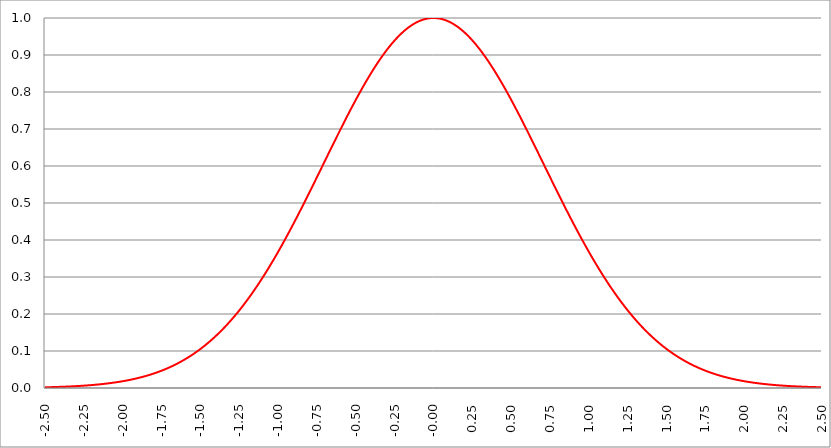
| Category | Series 1 | Series 0 | Series 2 |
|---|---|---|---|
| -2.5 | 0.002 |  |  |
| -2.4975 | 0.002 |  |  |
| -2.495 | 0.002 |  |  |
| -2.4925 | 0.002 |  |  |
| -2.49 | 0.002 |  |  |
| -2.4875 | 0.002 |  |  |
| -2.485 | 0.002 |  |  |
| -2.4825 | 0.002 |  |  |
| -2.48 | 0.002 |  |  |
| -2.4775 | 0.002 |  |  |
| -2.475000000000001 | 0.002 |  |  |
| -2.472500000000001 | 0.002 |  |  |
| -2.470000000000001 | 0.002 |  |  |
| -2.467500000000001 | 0.002 |  |  |
| -2.465000000000001 | 0.002 |  |  |
| -2.462500000000001 | 0.002 |  |  |
| -2.460000000000001 | 0.002 |  |  |
| -2.457500000000001 | 0.002 |  |  |
| -2.455000000000001 | 0.002 |  |  |
| -2.452500000000001 | 0.002 |  |  |
| -2.450000000000001 | 0.002 |  |  |
| -2.447500000000001 | 0.003 |  |  |
| -2.445000000000001 | 0.003 |  |  |
| -2.442500000000001 | 0.003 |  |  |
| -2.440000000000001 | 0.003 |  |  |
| -2.437500000000001 | 0.003 |  |  |
| -2.435000000000001 | 0.003 |  |  |
| -2.432500000000001 | 0.003 |  |  |
| -2.430000000000001 | 0.003 |  |  |
| -2.427500000000002 | 0.003 |  |  |
| -2.425000000000002 | 0.003 |  |  |
| -2.422500000000002 | 0.003 |  |  |
| -2.420000000000002 | 0.003 |  |  |
| -2.417500000000002 | 0.003 |  |  |
| -2.415000000000002 | 0.003 |  |  |
| -2.412500000000002 | 0.003 |  |  |
| -2.410000000000002 | 0.003 |  |  |
| -2.407500000000002 | 0.003 |  |  |
| -2.405000000000002 | 0.003 |  |  |
| -2.402500000000002 | 0.003 |  |  |
| -2.400000000000002 | 0.003 |  |  |
| -2.397500000000002 | 0.003 |  |  |
| -2.395000000000002 | 0.003 |  |  |
| -2.392500000000002 | 0.003 |  |  |
| -2.390000000000002 | 0.003 |  |  |
| -2.387500000000002 | 0.003 |  |  |
| -2.385000000000002 | 0.003 |  |  |
| -2.382500000000002 | 0.003 |  |  |
| -2.380000000000002 | 0.003 |  |  |
| -2.377500000000003 | 0.004 |  |  |
| -2.375000000000003 | 0.004 |  |  |
| -2.372500000000003 | 0.004 |  |  |
| -2.370000000000003 | 0.004 |  |  |
| -2.367500000000003 | 0.004 |  |  |
| -2.365000000000003 | 0.004 |  |  |
| -2.362500000000003 | 0.004 |  |  |
| -2.360000000000003 | 0.004 |  |  |
| -2.357500000000003 | 0.004 |  |  |
| -2.355000000000003 | 0.004 |  |  |
| -2.352500000000003 | 0.004 |  |  |
| -2.350000000000003 | 0.004 |  |  |
| -2.347500000000003 | 0.004 |  |  |
| -2.345000000000003 | 0.004 |  |  |
| -2.342500000000003 | 0.004 |  |  |
| -2.340000000000003 | 0.004 |  |  |
| -2.337500000000003 | 0.004 |  |  |
| -2.335000000000003 | 0.004 |  |  |
| -2.332500000000004 | 0.004 |  |  |
| -2.330000000000004 | 0.004 |  |  |
| -2.327500000000004 | 0.004 |  |  |
| -2.325000000000004 | 0.004 |  |  |
| -2.322500000000004 | 0.005 |  |  |
| -2.320000000000004 | 0.005 |  |  |
| -2.317500000000004 | 0.005 |  |  |
| -2.315000000000004 | 0.005 |  |  |
| -2.312500000000004 | 0.005 |  |  |
| -2.310000000000004 | 0.005 |  |  |
| -2.307500000000004 | 0.005 |  |  |
| -2.305000000000004 | 0.005 |  |  |
| -2.302500000000004 | 0.005 |  |  |
| -2.300000000000004 | 0.005 |  |  |
| -2.297500000000004 | 0.005 |  |  |
| -2.295000000000004 | 0.005 |  |  |
| -2.292500000000004 | 0.005 |  |  |
| -2.290000000000004 | 0.005 |  |  |
| -2.287500000000004 | 0.005 |  |  |
| -2.285000000000005 | 0.005 |  |  |
| -2.282500000000005 | 0.005 |  |  |
| -2.280000000000005 | 0.006 |  |  |
| -2.277500000000005 | 0.006 |  |  |
| -2.275000000000005 | 0.006 |  |  |
| -2.272500000000005 | 0.006 |  |  |
| -2.270000000000005 | 0.006 |  |  |
| -2.267500000000005 | 0.006 |  |  |
| -2.265000000000005 | 0.006 |  |  |
| -2.262500000000005 | 0.006 |  |  |
| -2.260000000000005 | 0.006 |  |  |
| -2.257500000000005 | 0.006 |  |  |
| -2.255000000000005 | 0.006 |  |  |
| -2.252500000000005 | 0.006 |  |  |
| -2.250000000000005 | 0.006 |  |  |
| -2.247500000000005 | 0.006 |  |  |
| -2.245000000000005 | 0.006 |  |  |
| -2.242500000000005 | 0.007 |  |  |
| -2.240000000000006 | 0.007 |  |  |
| -2.237500000000006 | 0.007 |  |  |
| -2.235000000000006 | 0.007 |  |  |
| -2.232500000000006 | 0.007 |  |  |
| -2.230000000000006 | 0.007 |  |  |
| -2.227500000000006 | 0.007 |  |  |
| -2.225000000000006 | 0.007 |  |  |
| -2.222500000000006 | 0.007 |  |  |
| -2.220000000000006 | 0.007 |  |  |
| -2.217500000000006 | 0.007 |  |  |
| -2.215000000000006 | 0.007 |  |  |
| -2.212500000000006 | 0.007 |  |  |
| -2.210000000000006 | 0.008 |  |  |
| -2.207500000000006 | 0.008 |  |  |
| -2.205000000000006 | 0.008 |  |  |
| -2.202500000000006 | 0.008 |  |  |
| -2.200000000000006 | 0.008 |  |  |
| -2.197500000000006 | 0.008 |  |  |
| -2.195000000000006 | 0.008 |  |  |
| -2.192500000000007 | 0.008 |  |  |
| -2.190000000000007 | 0.008 |  |  |
| -2.187500000000006 | 0.008 |  |  |
| -2.185000000000007 | 0.008 |  |  |
| -2.182500000000007 | 0.009 |  |  |
| -2.180000000000007 | 0.009 |  |  |
| -2.177500000000007 | 0.009 |  |  |
| -2.175000000000007 | 0.009 |  |  |
| -2.172500000000007 | 0.009 |  |  |
| -2.170000000000007 | 0.009 |  |  |
| -2.167500000000007 | 0.009 |  |  |
| -2.165000000000007 | 0.009 |  |  |
| -2.162500000000007 | 0.009 |  |  |
| -2.160000000000007 | 0.009 |  |  |
| -2.157500000000007 | 0.01 |  |  |
| -2.155000000000007 | 0.01 |  |  |
| -2.152500000000007 | 0.01 |  |  |
| -2.150000000000007 | 0.01 |  |  |
| -2.147500000000007 | 0.01 |  |  |
| -2.145000000000008 | 0.01 |  |  |
| -2.142500000000008 | 0.01 |  |  |
| -2.140000000000008 | 0.01 |  |  |
| -2.137500000000008 | 0.01 |  |  |
| -2.135000000000008 | 0.01 |  |  |
| -2.132500000000008 | 0.011 |  |  |
| -2.130000000000008 | 0.011 |  |  |
| -2.127500000000008 | 0.011 |  |  |
| -2.125000000000008 | 0.011 |  |  |
| -2.122500000000008 | 0.011 |  |  |
| -2.120000000000008 | 0.011 |  |  |
| -2.117500000000008 | 0.011 |  |  |
| -2.115000000000008 | 0.011 |  |  |
| -2.112500000000008 | 0.012 |  |  |
| -2.110000000000008 | 0.012 |  |  |
| -2.107500000000008 | 0.012 |  |  |
| -2.105000000000008 | 0.012 |  |  |
| -2.102500000000008 | 0.012 |  |  |
| -2.100000000000009 | 0.012 |  |  |
| -2.097500000000009 | 0.012 |  |  |
| -2.095000000000009 | 0.012 |  |  |
| -2.092500000000009 | 0.013 |  |  |
| -2.090000000000009 | 0.013 |  |  |
| -2.087500000000009 | 0.013 |  |  |
| -2.085000000000009 | 0.013 |  |  |
| -2.082500000000009 | 0.013 |  |  |
| -2.080000000000009 | 0.013 |  |  |
| -2.077500000000009 | 0.013 |  |  |
| -2.075000000000009 | 0.013 |  |  |
| -2.072500000000009 | 0.014 |  |  |
| -2.070000000000009 | 0.014 |  |  |
| -2.06750000000001 | 0.014 |  |  |
| -2.065000000000009 | 0.014 |  |  |
| -2.062500000000009 | 0.014 |  |  |
| -2.060000000000009 | 0.014 |  |  |
| -2.057500000000009 | 0.015 |  |  |
| -2.055000000000009 | 0.015 |  |  |
| -2.05250000000001 | 0.015 |  |  |
| -2.05000000000001 | 0.015 |  |  |
| -2.04750000000001 | 0.015 |  |  |
| -2.04500000000001 | 0.015 |  |  |
| -2.04250000000001 | 0.015 |  |  |
| -2.04000000000001 | 0.016 |  |  |
| -2.03750000000001 | 0.016 |  |  |
| -2.03500000000001 | 0.016 |  |  |
| -2.03250000000001 | 0.016 |  |  |
| -2.03000000000001 | 0.016 |  |  |
| -2.02750000000001 | 0.016 |  |  |
| -2.02500000000001 | 0.017 |  |  |
| -2.02250000000001 | 0.017 |  |  |
| -2.02000000000001 | 0.017 |  |  |
| -2.01750000000001 | 0.017 |  |  |
| -2.01500000000001 | 0.017 |  |  |
| -2.01250000000001 | 0.017 |  |  |
| -2.01000000000001 | 0.018 |  |  |
| -2.00750000000001 | 0.018 |  |  |
| -2.005000000000011 | 0.018 |  |  |
| -2.002500000000011 | 0.018 |  |  |
| -2.000000000000011 | 0.018 |  |  |
| -1.997500000000011 | 0.018 |  |  |
| -1.995000000000011 | 0.019 |  |  |
| -1.992500000000011 | 0.019 |  |  |
| -1.990000000000011 | 0.019 |  |  |
| -1.987500000000011 | 0.019 |  |  |
| -1.985000000000011 | 0.019 |  |  |
| -1.982500000000011 | 0.02 |  |  |
| -1.980000000000011 | 0.02 |  |  |
| -1.977500000000011 | 0.02 |  |  |
| -1.975000000000011 | 0.02 |  |  |
| -1.972500000000011 | 0.02 |  |  |
| -1.970000000000011 | 0.021 |  |  |
| -1.967500000000011 | 0.021 |  |  |
| -1.965000000000011 | 0.021 |  |  |
| -1.962500000000011 | 0.021 |  |  |
| -1.960000000000011 | 0.021 |  |  |
| -1.957500000000012 | 0.022 |  |  |
| -1.955000000000012 | 0.022 |  |  |
| -1.952500000000012 | 0.022 |  |  |
| -1.950000000000012 | 0.022 |  |  |
| -1.947500000000012 | 0.023 |  |  |
| -1.945000000000012 | 0.023 |  |  |
| -1.942500000000012 | 0.023 |  |  |
| -1.940000000000012 | 0.023 |  |  |
| -1.937500000000012 | 0.023 |  |  |
| -1.935000000000012 | 0.024 |  |  |
| -1.932500000000012 | 0.024 |  |  |
| -1.930000000000012 | 0.024 |  |  |
| -1.927500000000012 | 0.024 |  |  |
| -1.925000000000012 | 0.025 |  |  |
| -1.922500000000012 | 0.025 |  |  |
| -1.920000000000012 | 0.025 |  |  |
| -1.917500000000012 | 0.025 |  |  |
| -1.915000000000012 | 0.026 |  |  |
| -1.912500000000012 | 0.026 |  |  |
| -1.910000000000013 | 0.026 |  |  |
| -1.907500000000013 | 0.026 |  |  |
| -1.905000000000013 | 0.027 |  |  |
| -1.902500000000013 | 0.027 |  |  |
| -1.900000000000013 | 0.027 |  |  |
| -1.897500000000013 | 0.027 |  |  |
| -1.895000000000013 | 0.028 |  |  |
| -1.892500000000013 | 0.028 |  |  |
| -1.890000000000013 | 0.028 |  |  |
| -1.887500000000013 | 0.028 |  |  |
| -1.885000000000013 | 0.029 |  |  |
| -1.882500000000013 | 0.029 |  |  |
| -1.880000000000013 | 0.029 |  |  |
| -1.877500000000013 | 0.029 |  |  |
| -1.875000000000013 | 0.03 |  |  |
| -1.872500000000013 | 0.03 |  |  |
| -1.870000000000013 | 0.03 |  |  |
| -1.867500000000013 | 0.031 |  |  |
| -1.865000000000013 | 0.031 |  |  |
| -1.862500000000014 | 0.031 |  |  |
| -1.860000000000014 | 0.031 |  |  |
| -1.857500000000014 | 0.032 |  |  |
| -1.855000000000014 | 0.032 |  |  |
| -1.852500000000014 | 0.032 |  |  |
| -1.850000000000014 | 0.033 |  |  |
| -1.847500000000014 | 0.033 |  |  |
| -1.845000000000014 | 0.033 |  |  |
| -1.842500000000014 | 0.034 |  |  |
| -1.840000000000014 | 0.034 |  |  |
| -1.837500000000014 | 0.034 |  |  |
| -1.835000000000014 | 0.034 |  |  |
| -1.832500000000014 | 0.035 |  |  |
| -1.830000000000014 | 0.035 |  |  |
| -1.827500000000014 | 0.035 |  |  |
| -1.825000000000014 | 0.036 |  |  |
| -1.822500000000014 | 0.036 |  |  |
| -1.820000000000014 | 0.036 |  |  |
| -1.817500000000015 | 0.037 |  |  |
| -1.815000000000015 | 0.037 |  |  |
| -1.812500000000015 | 0.037 |  |  |
| -1.810000000000015 | 0.038 |  |  |
| -1.807500000000015 | 0.038 |  |  |
| -1.805000000000015 | 0.038 |  |  |
| -1.802500000000015 | 0.039 |  |  |
| -1.800000000000015 | 0.039 |  |  |
| -1.797500000000015 | 0.04 |  |  |
| -1.795000000000015 | 0.04 |  |  |
| -1.792500000000015 | 0.04 |  |  |
| -1.790000000000015 | 0.041 |  |  |
| -1.787500000000015 | 0.041 |  |  |
| -1.785000000000015 | 0.041 |  |  |
| -1.782500000000015 | 0.042 |  |  |
| -1.780000000000015 | 0.042 |  |  |
| -1.777500000000015 | 0.042 |  |  |
| -1.775000000000015 | 0.043 |  |  |
| -1.772500000000015 | 0.043 |  |  |
| -1.770000000000015 | 0.044 |  |  |
| -1.767500000000016 | 0.044 |  |  |
| -1.765000000000016 | 0.044 |  |  |
| -1.762500000000016 | 0.045 |  |  |
| -1.760000000000016 | 0.045 |  |  |
| -1.757500000000016 | 0.046 |  |  |
| -1.755000000000016 | 0.046 |  |  |
| -1.752500000000016 | 0.046 |  |  |
| -1.750000000000016 | 0.047 |  |  |
| -1.747500000000016 | 0.047 |  |  |
| -1.745000000000016 | 0.048 |  |  |
| -1.742500000000016 | 0.048 |  |  |
| -1.740000000000016 | 0.048 |  |  |
| -1.737500000000016 | 0.049 |  |  |
| -1.735000000000016 | 0.049 |  |  |
| -1.732500000000016 | 0.05 |  |  |
| -1.730000000000016 | 0.05 |  |  |
| -1.727500000000016 | 0.051 |  |  |
| -1.725000000000016 | 0.051 |  |  |
| -1.722500000000017 | 0.051 |  |  |
| -1.720000000000017 | 0.052 |  |  |
| -1.717500000000017 | 0.052 |  |  |
| -1.715000000000017 | 0.053 |  |  |
| -1.712500000000017 | 0.053 |  |  |
| -1.710000000000017 | 0.054 |  |  |
| -1.707500000000017 | 0.054 |  |  |
| -1.705000000000017 | 0.055 |  |  |
| -1.702500000000017 | 0.055 |  |  |
| -1.700000000000017 | 0.056 |  |  |
| -1.697500000000017 | 0.056 |  |  |
| -1.695000000000017 | 0.057 |  |  |
| -1.692500000000017 | 0.057 |  |  |
| -1.690000000000017 | 0.057 |  |  |
| -1.687500000000017 | 0.058 |  |  |
| -1.685000000000017 | 0.058 |  |  |
| -1.682500000000017 | 0.059 |  |  |
| -1.680000000000017 | 0.059 |  |  |
| -1.677500000000017 | 0.06 |  |  |
| -1.675000000000017 | 0.06 |  |  |
| -1.672500000000018 | 0.061 |  |  |
| -1.670000000000018 | 0.061 |  |  |
| -1.667500000000018 | 0.062 |  |  |
| -1.665000000000018 | 0.063 |  |  |
| -1.662500000000018 | 0.063 |  |  |
| -1.660000000000018 | 0.064 |  |  |
| -1.657500000000018 | 0.064 |  |  |
| -1.655000000000018 | 0.065 |  |  |
| -1.652500000000018 | 0.065 |  |  |
| -1.650000000000018 | 0.066 |  |  |
| -1.647500000000018 | 0.066 |  |  |
| -1.645000000000018 | 0.067 |  |  |
| -1.642500000000018 | 0.067 |  |  |
| -1.640000000000018 | 0.068 |  |  |
| -1.637500000000018 | 0.068 |  |  |
| -1.635000000000018 | 0.069 |  |  |
| -1.632500000000018 | 0.07 |  |  |
| -1.630000000000018 | 0.07 |  |  |
| -1.627500000000019 | 0.071 |  |  |
| -1.625000000000019 | 0.071 |  |  |
| -1.622500000000019 | 0.072 |  |  |
| -1.620000000000019 | 0.072 |  |  |
| -1.617500000000019 | 0.073 |  |  |
| -1.615000000000019 | 0.074 |  |  |
| -1.612500000000019 | 0.074 |  |  |
| -1.610000000000019 | 0.075 |  |  |
| -1.607500000000019 | 0.075 |  |  |
| -1.605000000000019 | 0.076 |  |  |
| -1.60250000000002 | 0.077 |  |  |
| -1.60000000000002 | 0.077 |  |  |
| -1.597500000000019 | 0.078 |  |  |
| -1.595000000000019 | 0.079 |  |  |
| -1.592500000000019 | 0.079 |  |  |
| -1.590000000000019 | 0.08 |  |  |
| -1.587500000000019 | 0.08 |  |  |
| -1.585000000000019 | 0.081 |  |  |
| -1.58250000000002 | 0.082 |  |  |
| -1.58000000000002 | 0.082 |  |  |
| -1.57750000000002 | 0.083 |  |  |
| -1.57500000000002 | 0.084 |  |  |
| -1.57250000000002 | 0.084 |  |  |
| -1.57000000000002 | 0.085 |  |  |
| -1.56750000000002 | 0.086 |  |  |
| -1.56500000000002 | 0.086 |  |  |
| -1.56250000000002 | 0.087 |  |  |
| -1.56000000000002 | 0.088 |  |  |
| -1.55750000000002 | 0.088 |  |  |
| -1.55500000000002 | 0.089 |  |  |
| -1.55250000000002 | 0.09 |  |  |
| -1.55000000000002 | 0.09 |  |  |
| -1.54750000000002 | 0.091 |  |  |
| -1.54500000000002 | 0.092 |  |  |
| -1.54250000000002 | 0.093 |  |  |
| -1.54000000000002 | 0.093 |  |  |
| -1.537500000000021 | 0.094 |  |  |
| -1.535000000000021 | 0.095 |  |  |
| -1.532500000000021 | 0.096 |  |  |
| -1.530000000000021 | 0.096 |  |  |
| -1.527500000000021 | 0.097 |  |  |
| -1.525000000000021 | 0.098 |  |  |
| -1.522500000000021 | 0.098 |  |  |
| -1.520000000000021 | 0.099 |  |  |
| -1.517500000000021 | 0.1 |  |  |
| -1.515000000000021 | 0.101 |  |  |
| -1.512500000000021 | 0.102 |  |  |
| -1.510000000000021 | 0.102 |  |  |
| -1.507500000000021 | 0.103 |  |  |
| -1.505000000000021 | 0.104 |  |  |
| -1.502500000000021 | 0.105 |  |  |
| -1.500000000000021 | 0.105 |  |  |
| -1.497500000000021 | 0.106 |  |  |
| -1.495000000000021 | 0.107 |  |  |
| -1.492500000000021 | 0.108 |  |  |
| -1.490000000000021 | 0.109 |  |  |
| -1.487500000000022 | 0.109 |  |  |
| -1.485000000000022 | 0.11 |  |  |
| -1.482500000000022 | 0.111 |  |  |
| -1.480000000000022 | 0.112 |  |  |
| -1.477500000000022 | 0.113 |  |  |
| -1.475000000000022 | 0.114 |  |  |
| -1.472500000000022 | 0.114 |  |  |
| -1.470000000000022 | 0.115 |  |  |
| -1.467500000000022 | 0.116 |  |  |
| -1.465000000000022 | 0.117 |  |  |
| -1.462500000000022 | 0.118 |  |  |
| -1.460000000000022 | 0.119 |  |  |
| -1.457500000000022 | 0.12 |  |  |
| -1.455000000000022 | 0.12 |  |  |
| -1.452500000000022 | 0.121 |  |  |
| -1.450000000000022 | 0.122 |  |  |
| -1.447500000000022 | 0.123 |  |  |
| -1.445000000000022 | 0.124 |  |  |
| -1.442500000000023 | 0.125 |  |  |
| -1.440000000000023 | 0.126 |  |  |
| -1.437500000000023 | 0.127 |  |  |
| -1.435000000000023 | 0.128 |  |  |
| -1.432500000000023 | 0.128 |  |  |
| -1.430000000000023 | 0.129 |  |  |
| -1.427500000000023 | 0.13 |  |  |
| -1.425000000000023 | 0.131 |  |  |
| -1.422500000000023 | 0.132 |  |  |
| -1.420000000000023 | 0.133 |  |  |
| -1.417500000000023 | 0.134 |  |  |
| -1.415000000000023 | 0.135 |  |  |
| -1.412500000000023 | 0.136 |  |  |
| -1.410000000000023 | 0.137 |  |  |
| -1.407500000000023 | 0.138 |  |  |
| -1.405000000000023 | 0.139 |  |  |
| -1.402500000000023 | 0.14 |  |  |
| -1.400000000000023 | 0.141 |  |  |
| -1.397500000000023 | 0.142 |  |  |
| -1.395000000000023 | 0.143 |  |  |
| -1.392500000000024 | 0.144 |  |  |
| -1.390000000000024 | 0.145 |  |  |
| -1.387500000000024 | 0.146 |  |  |
| -1.385000000000024 | 0.147 |  |  |
| -1.382500000000024 | 0.148 |  |  |
| -1.380000000000024 | 0.149 |  |  |
| -1.377500000000024 | 0.15 |  |  |
| -1.375000000000024 | 0.151 |  |  |
| -1.372500000000024 | 0.152 |  |  |
| -1.370000000000024 | 0.153 |  |  |
| -1.367500000000024 | 0.154 |  |  |
| -1.365000000000024 | 0.155 |  |  |
| -1.362500000000024 | 0.156 |  |  |
| -1.360000000000024 | 0.157 |  |  |
| -1.357500000000024 | 0.158 |  |  |
| -1.355000000000024 | 0.159 |  |  |
| -1.352500000000024 | 0.161 |  |  |
| -1.350000000000024 | 0.162 |  |  |
| -1.347500000000025 | 0.163 |  |  |
| -1.345000000000025 | 0.164 |  |  |
| -1.342500000000025 | 0.165 |  |  |
| -1.340000000000025 | 0.166 |  |  |
| -1.337500000000025 | 0.167 |  |  |
| -1.335000000000025 | 0.168 |  |  |
| -1.332500000000025 | 0.169 |  |  |
| -1.330000000000025 | 0.171 |  |  |
| -1.327500000000025 | 0.172 |  |  |
| -1.325000000000025 | 0.173 |  |  |
| -1.322500000000025 | 0.174 |  |  |
| -1.320000000000025 | 0.175 |  |  |
| -1.317500000000025 | 0.176 |  |  |
| -1.315000000000025 | 0.177 |  |  |
| -1.312500000000025 | 0.179 |  |  |
| -1.310000000000025 | 0.18 |  |  |
| -1.307500000000025 | 0.181 |  |  |
| -1.305000000000025 | 0.182 |  |  |
| -1.302500000000025 | 0.183 |  |  |
| -1.300000000000026 | 0.185 |  |  |
| -1.297500000000026 | 0.186 |  |  |
| -1.295000000000026 | 0.187 |  |  |
| -1.292500000000026 | 0.188 |  |  |
| -1.290000000000026 | 0.189 |  |  |
| -1.287500000000026 | 0.191 |  |  |
| -1.285000000000026 | 0.192 |  |  |
| -1.282500000000026 | 0.193 |  |  |
| -1.280000000000026 | 0.194 |  |  |
| -1.277500000000026 | 0.196 |  |  |
| -1.275000000000026 | 0.197 |  |  |
| -1.272500000000026 | 0.198 |  |  |
| -1.270000000000026 | 0.199 |  |  |
| -1.267500000000026 | 0.201 |  |  |
| -1.265000000000026 | 0.202 |  |  |
| -1.262500000000026 | 0.203 |  |  |
| -1.260000000000026 | 0.204 |  |  |
| -1.257500000000026 | 0.206 |  |  |
| -1.255000000000027 | 0.207 |  |  |
| -1.252500000000027 | 0.208 |  |  |
| -1.250000000000027 | 0.21 |  |  |
| -1.247500000000027 | 0.211 |  |  |
| -1.245000000000027 | 0.212 |  |  |
| -1.242500000000027 | 0.214 |  |  |
| -1.240000000000027 | 0.215 |  |  |
| -1.237500000000027 | 0.216 |  |  |
| -1.235000000000027 | 0.218 |  |  |
| -1.232500000000027 | 0.219 |  |  |
| -1.230000000000027 | 0.22 |  |  |
| -1.227500000000027 | 0.222 |  |  |
| -1.225000000000027 | 0.223 |  |  |
| -1.222500000000027 | 0.224 |  |  |
| -1.220000000000027 | 0.226 |  |  |
| -1.217500000000027 | 0.227 |  |  |
| -1.215000000000027 | 0.228 |  |  |
| -1.212500000000027 | 0.23 |  |  |
| -1.210000000000027 | 0.231 |  |  |
| -1.207500000000028 | 0.233 |  |  |
| -1.205000000000028 | 0.234 |  |  |
| -1.202500000000028 | 0.236 |  |  |
| -1.200000000000028 | 0.237 |  |  |
| -1.197500000000028 | 0.238 |  |  |
| -1.195000000000028 | 0.24 |  |  |
| -1.192500000000028 | 0.241 |  |  |
| -1.190000000000028 | 0.243 |  |  |
| -1.187500000000028 | 0.244 |  |  |
| -1.185000000000028 | 0.246 |  |  |
| -1.182500000000028 | 0.247 |  |  |
| -1.180000000000028 | 0.248 |  |  |
| -1.177500000000028 | 0.25 |  |  |
| -1.175000000000028 | 0.251 |  |  |
| -1.172500000000028 | 0.253 |  |  |
| -1.170000000000028 | 0.254 |  |  |
| -1.167500000000028 | 0.256 |  |  |
| -1.165000000000028 | 0.257 |  |  |
| -1.162500000000028 | 0.259 |  |  |
| -1.160000000000029 | 0.26 |  |  |
| -1.157500000000029 | 0.262 |  |  |
| -1.155000000000029 | 0.263 |  |  |
| -1.152500000000029 | 0.265 |  |  |
| -1.150000000000029 | 0.266 |  |  |
| -1.147500000000029 | 0.268 |  |  |
| -1.145000000000029 | 0.27 |  |  |
| -1.142500000000029 | 0.271 |  |  |
| -1.140000000000029 | 0.273 |  |  |
| -1.13750000000003 | 0.274 |  |  |
| -1.13500000000003 | 0.276 |  |  |
| -1.13250000000003 | 0.277 |  |  |
| -1.13000000000003 | 0.279 |  |  |
| -1.127500000000029 | 0.28 |  |  |
| -1.125000000000029 | 0.282 |  |  |
| -1.122500000000029 | 0.284 |  |  |
| -1.120000000000029 | 0.285 |  |  |
| -1.117500000000029 | 0.287 |  |  |
| -1.11500000000003 | 0.288 |  |  |
| -1.11250000000003 | 0.29 |  |  |
| -1.11000000000003 | 0.292 |  |  |
| -1.10750000000003 | 0.293 |  |  |
| -1.10500000000003 | 0.295 |  |  |
| -1.10250000000003 | 0.297 |  |  |
| -1.10000000000003 | 0.298 |  |  |
| -1.09750000000003 | 0.3 |  |  |
| -1.09500000000003 | 0.301 |  |  |
| -1.09250000000003 | 0.303 |  |  |
| -1.09000000000003 | 0.305 |  |  |
| -1.08750000000003 | 0.306 |  |  |
| -1.08500000000003 | 0.308 |  |  |
| -1.08250000000003 | 0.31 |  |  |
| -1.08000000000003 | 0.311 |  |  |
| -1.07750000000003 | 0.313 |  |  |
| -1.07500000000003 | 0.315 |  |  |
| -1.07250000000003 | 0.317 |  |  |
| -1.07000000000003 | 0.318 |  |  |
| -1.067500000000031 | 0.32 |  |  |
| -1.065000000000031 | 0.322 |  |  |
| -1.062500000000031 | 0.323 |  |  |
| -1.060000000000031 | 0.325 |  |  |
| -1.057500000000031 | 0.327 |  |  |
| -1.055000000000031 | 0.329 |  |  |
| -1.052500000000031 | 0.33 |  |  |
| -1.050000000000031 | 0.332 |  |  |
| -1.047500000000031 | 0.334 |  |  |
| -1.045000000000031 | 0.336 |  |  |
| -1.042500000000031 | 0.337 |  |  |
| -1.040000000000031 | 0.339 |  |  |
| -1.037500000000031 | 0.341 |  |  |
| -1.035000000000031 | 0.343 |  |  |
| -1.032500000000031 | 0.344 |  |  |
| -1.030000000000031 | 0.346 |  |  |
| -1.027500000000031 | 0.348 |  |  |
| -1.025000000000031 | 0.35 |  |  |
| -1.022500000000031 | 0.352 |  |  |
| -1.020000000000032 | 0.353 |  |  |
| -1.017500000000032 | 0.355 |  |  |
| -1.015000000000032 | 0.357 |  |  |
| -1.012500000000032 | 0.359 |  |  |
| -1.010000000000032 | 0.361 |  |  |
| -1.007500000000032 | 0.362 |  |  |
| -1.005000000000032 | 0.364 |  |  |
| -1.002500000000032 | 0.366 |  |  |
| -1.000000000000032 | 0.368 |  |  |
| -0.997500000000032 | 0.37 |  |  |
| -0.995000000000032 | 0.372 |  |  |
| -0.992500000000032 | 0.373 |  |  |
| -0.990000000000032 | 0.375 |  |  |
| -0.987500000000032 | 0.377 |  |  |
| -0.985000000000032 | 0.379 |  |  |
| -0.982500000000032 | 0.381 |  |  |
| -0.980000000000032 | 0.383 |  |  |
| -0.977500000000032 | 0.385 |  |  |
| -0.975000000000032 | 0.386 |  |  |
| -0.972500000000033 | 0.388 |  |  |
| -0.970000000000033 | 0.39 |  |  |
| -0.967500000000033 | 0.392 |  |  |
| -0.965000000000033 | 0.394 |  |  |
| -0.962500000000033 | 0.396 |  |  |
| -0.960000000000033 | 0.398 |  |  |
| -0.957500000000033 | 0.4 |  |  |
| -0.955000000000033 | 0.402 |  |  |
| -0.952500000000033 | 0.404 |  |  |
| -0.950000000000033 | 0.406 |  |  |
| -0.947500000000033 | 0.407 |  |  |
| -0.945000000000033 | 0.409 |  |  |
| -0.942500000000033 | 0.411 |  |  |
| -0.940000000000033 | 0.413 |  |  |
| -0.937500000000033 | 0.415 |  |  |
| -0.935000000000033 | 0.417 |  |  |
| -0.932500000000033 | 0.419 |  |  |
| -0.930000000000033 | 0.421 |  |  |
| -0.927500000000033 | 0.423 |  |  |
| -0.925000000000034 | 0.425 |  |  |
| -0.922500000000034 | 0.427 |  |  |
| -0.920000000000034 | 0.429 |  |  |
| -0.917500000000034 | 0.431 |  |  |
| -0.915000000000034 | 0.433 |  |  |
| -0.912500000000034 | 0.435 |  |  |
| -0.910000000000034 | 0.437 |  |  |
| -0.907500000000034 | 0.439 |  |  |
| -0.905000000000034 | 0.441 |  |  |
| -0.902500000000034 | 0.443 |  |  |
| -0.900000000000034 | 0.445 |  |  |
| -0.897500000000034 | 0.447 |  |  |
| -0.895000000000034 | 0.449 |  |  |
| -0.892500000000034 | 0.451 |  |  |
| -0.890000000000034 | 0.453 |  |  |
| -0.887500000000034 | 0.455 |  |  |
| -0.885000000000034 | 0.457 |  |  |
| -0.882500000000034 | 0.459 |  |  |
| -0.880000000000034 | 0.461 |  |  |
| -0.877500000000035 | 0.463 |  |  |
| -0.875000000000035 | 0.465 |  |  |
| -0.872500000000035 | 0.467 |  |  |
| -0.870000000000035 | 0.469 |  |  |
| -0.867500000000035 | 0.471 |  |  |
| -0.865000000000035 | 0.473 |  |  |
| -0.862500000000035 | 0.475 |  |  |
| -0.860000000000035 | 0.477 |  |  |
| -0.857500000000035 | 0.479 |  |  |
| -0.855000000000035 | 0.481 |  |  |
| -0.852500000000035 | 0.483 |  |  |
| -0.850000000000035 | 0.486 |  |  |
| -0.847500000000035 | 0.488 |  |  |
| -0.845000000000035 | 0.49 |  |  |
| -0.842500000000035 | 0.492 |  |  |
| -0.840000000000035 | 0.494 |  |  |
| -0.837500000000035 | 0.496 |  |  |
| -0.835000000000035 | 0.498 |  |  |
| -0.832500000000035 | 0.5 |  |  |
| -0.830000000000036 | 0.502 |  |  |
| -0.827500000000036 | 0.504 |  |  |
| -0.825000000000036 | 0.506 |  |  |
| -0.822500000000036 | 0.508 |  |  |
| -0.820000000000036 | 0.51 |  |  |
| -0.817500000000036 | 0.513 |  |  |
| -0.815000000000036 | 0.515 |  |  |
| -0.812500000000036 | 0.517 |  |  |
| -0.810000000000036 | 0.519 |  |  |
| -0.807500000000036 | 0.521 |  |  |
| -0.805000000000036 | 0.523 |  |  |
| -0.802500000000036 | 0.525 |  |  |
| -0.800000000000036 | 0.527 |  |  |
| -0.797500000000036 | 0.529 |  |  |
| -0.795000000000036 | 0.532 |  |  |
| -0.792500000000036 | 0.534 |  |  |
| -0.790000000000036 | 0.536 |  |  |
| -0.787500000000036 | 0.538 |  |  |
| -0.785000000000036 | 0.54 |  |  |
| -0.782500000000037 | 0.542 |  |  |
| -0.780000000000037 | 0.544 |  |  |
| -0.777500000000037 | 0.546 |  |  |
| -0.775000000000037 | 0.548 |  |  |
| -0.772500000000037 | 0.551 |  |  |
| -0.770000000000037 | 0.553 |  |  |
| -0.767500000000037 | 0.555 |  |  |
| -0.765000000000037 | 0.557 |  |  |
| -0.762500000000037 | 0.559 |  |  |
| -0.760000000000037 | 0.561 |  |  |
| -0.757500000000037 | 0.563 |  |  |
| -0.755000000000037 | 0.566 |  |  |
| -0.752500000000037 | 0.568 |  |  |
| -0.750000000000037 | 0.57 |  |  |
| -0.747500000000037 | 0.572 |  |  |
| -0.745000000000037 | 0.574 |  |  |
| -0.742500000000037 | 0.576 |  |  |
| -0.740000000000037 | 0.578 |  |  |
| -0.737500000000037 | 0.58 |  |  |
| -0.735000000000038 | 0.583 |  |  |
| -0.732500000000038 | 0.585 |  |  |
| -0.730000000000038 | 0.587 |  |  |
| -0.727500000000038 | 0.589 |  |  |
| -0.725000000000038 | 0.591 |  |  |
| -0.722500000000038 | 0.593 |  |  |
| -0.720000000000038 | 0.595 |  |  |
| -0.717500000000038 | 0.598 |  |  |
| -0.715000000000038 | 0.6 |  |  |
| -0.712500000000038 | 0.602 |  |  |
| -0.710000000000038 | 0.604 |  |  |
| -0.707500000000038 | 0.606 |  |  |
| -0.705000000000038 | 0.608 |  |  |
| -0.702500000000038 | 0.61 |  |  |
| -0.700000000000038 | 0.613 |  |  |
| -0.697500000000038 | 0.615 |  |  |
| -0.695000000000038 | 0.617 |  |  |
| -0.692500000000038 | 0.619 |  |  |
| -0.690000000000038 | 0.621 |  |  |
| -0.687500000000039 | 0.623 |  |  |
| -0.685000000000039 | 0.625 |  |  |
| -0.682500000000039 | 0.628 |  |  |
| -0.680000000000039 | 0.63 |  |  |
| -0.677500000000039 | 0.632 |  |  |
| -0.675000000000039 | 0.634 |  |  |
| -0.672500000000039 | 0.636 |  |  |
| -0.670000000000039 | 0.638 |  |  |
| -0.667500000000039 | 0.64 |  |  |
| -0.665000000000039 | 0.643 |  |  |
| -0.662500000000039 | 0.645 |  |  |
| -0.660000000000039 | 0.647 |  |  |
| -0.657500000000039 | 0.649 |  |  |
| -0.655000000000039 | 0.651 |  |  |
| -0.652500000000039 | 0.653 |  |  |
| -0.650000000000039 | 0.655 |  |  |
| -0.647500000000039 | 0.658 |  |  |
| -0.645000000000039 | 0.66 |  |  |
| -0.642500000000039 | 0.662 |  |  |
| -0.64000000000004 | 0.664 |  |  |
| -0.63750000000004 | 0.666 |  |  |
| -0.63500000000004 | 0.668 |  |  |
| -0.63250000000004 | 0.67 |  |  |
| -0.63000000000004 | 0.672 |  |  |
| -0.62750000000004 | 0.675 |  |  |
| -0.62500000000004 | 0.677 |  |  |
| -0.62250000000004 | 0.679 |  |  |
| -0.62000000000004 | 0.681 |  |  |
| -0.61750000000004 | 0.683 |  |  |
| -0.61500000000004 | 0.685 |  |  |
| -0.61250000000004 | 0.687 |  |  |
| -0.61000000000004 | 0.689 |  |  |
| -0.60750000000004 | 0.691 |  |  |
| -0.60500000000004 | 0.693 |  |  |
| -0.60250000000004 | 0.696 |  |  |
| -0.60000000000004 | 0.698 |  |  |
| -0.597500000000041 | 0.7 |  |  |
| -0.595000000000041 | 0.702 |  |  |
| -0.592500000000041 | 0.704 |  |  |
| -0.590000000000041 | 0.706 |  |  |
| -0.587500000000041 | 0.708 |  |  |
| -0.585000000000041 | 0.71 |  |  |
| -0.582500000000041 | 0.712 |  |  |
| -0.580000000000041 | 0.714 |  |  |
| -0.577500000000041 | 0.716 |  |  |
| -0.575000000000041 | 0.718 |  |  |
| -0.572500000000041 | 0.721 |  |  |
| -0.570000000000041 | 0.723 |  |  |
| -0.567500000000041 | 0.725 |  |  |
| -0.565000000000041 | 0.727 |  |  |
| -0.562500000000041 | 0.729 |  |  |
| -0.560000000000041 | 0.731 |  |  |
| -0.557500000000041 | 0.733 |  |  |
| -0.555000000000041 | 0.735 |  |  |
| -0.552500000000042 | 0.737 |  |  |
| -0.550000000000042 | 0.739 |  |  |
| -0.547500000000042 | 0.741 |  |  |
| -0.545000000000042 | 0.743 |  |  |
| -0.542500000000042 | 0.745 |  |  |
| -0.540000000000042 | 0.747 |  |  |
| -0.537500000000042 | 0.749 |  |  |
| -0.535000000000042 | 0.751 |  |  |
| -0.532500000000042 | 0.753 |  |  |
| -0.530000000000042 | 0.755 |  |  |
| -0.527500000000042 | 0.757 |  |  |
| -0.525000000000042 | 0.759 |  |  |
| -0.522500000000042 | 0.761 |  |  |
| -0.520000000000042 | 0.763 |  |  |
| -0.517500000000042 | 0.765 |  |  |
| -0.515000000000042 | 0.767 |  |  |
| -0.512500000000042 | 0.769 |  |  |
| -0.510000000000042 | 0.771 |  |  |
| -0.507500000000042 | 0.773 |  |  |
| -0.505000000000043 | 0.775 |  |  |
| -0.502500000000043 | 0.777 |  |  |
| -0.500000000000043 | 0.779 |  |  |
| -0.497500000000043 | 0.781 |  |  |
| -0.495000000000043 | 0.783 |  |  |
| -0.492500000000043 | 0.785 |  |  |
| -0.490000000000043 | 0.787 |  |  |
| -0.487500000000043 | 0.788 |  |  |
| -0.485000000000043 | 0.79 |  |  |
| -0.482500000000043 | 0.792 |  |  |
| -0.480000000000043 | 0.794 |  |  |
| -0.477500000000043 | 0.796 |  |  |
| -0.475000000000043 | 0.798 |  |  |
| -0.472500000000043 | 0.8 |  |  |
| -0.470000000000043 | 0.802 |  |  |
| -0.467500000000043 | 0.804 |  |  |
| -0.465000000000043 | 0.806 |  |  |
| -0.462500000000043 | 0.807 |  |  |
| -0.460000000000043 | 0.809 |  |  |
| -0.457500000000043 | 0.811 |  |  |
| -0.455000000000043 | 0.813 |  |  |
| -0.452500000000043 | 0.815 |  |  |
| -0.450000000000043 | 0.817 |  |  |
| -0.447500000000043 | 0.819 |  |  |
| -0.445000000000043 | 0.82 |  |  |
| -0.442500000000043 | 0.822 |  |  |
| -0.440000000000043 | 0.824 |  |  |
| -0.437500000000043 | 0.826 |  |  |
| -0.435000000000043 | 0.828 |  |  |
| -0.432500000000043 | 0.829 |  |  |
| -0.430000000000043 | 0.831 |  |  |
| -0.427500000000043 | 0.833 |  |  |
| -0.425000000000043 | 0.835 |  |  |
| -0.422500000000043 | 0.837 |  |  |
| -0.420000000000043 | 0.838 |  |  |
| -0.417500000000043 | 0.84 |  |  |
| -0.415000000000043 | 0.842 |  |  |
| -0.412500000000043 | 0.844 |  |  |
| -0.410000000000043 | 0.845 |  |  |
| -0.407500000000043 | 0.847 |  |  |
| -0.405000000000043 | 0.849 |  |  |
| -0.402500000000043 | 0.85 |  |  |
| -0.400000000000043 | 0.852 |  |  |
| -0.397500000000042 | 0.854 |  |  |
| -0.395000000000042 | 0.856 |  |  |
| -0.392500000000042 | 0.857 |  |  |
| -0.390000000000042 | 0.859 |  |  |
| -0.387500000000042 | 0.861 |  |  |
| -0.385000000000042 | 0.862 |  |  |
| -0.382500000000042 | 0.864 |  |  |
| -0.380000000000042 | 0.866 |  |  |
| -0.377500000000042 | 0.867 |  |  |
| -0.375000000000042 | 0.869 |  |  |
| -0.372500000000042 | 0.87 |  |  |
| -0.370000000000042 | 0.872 |  |  |
| -0.367500000000042 | 0.874 |  |  |
| -0.365000000000042 | 0.875 |  |  |
| -0.362500000000042 | 0.877 |  |  |
| -0.360000000000042 | 0.878 |  |  |
| -0.357500000000042 | 0.88 |  |  |
| -0.355000000000042 | 0.882 |  |  |
| -0.352500000000042 | 0.883 |  |  |
| -0.350000000000042 | 0.885 |  |  |
| -0.347500000000042 | 0.886 |  |  |
| -0.345000000000042 | 0.888 |  |  |
| -0.342500000000042 | 0.889 |  |  |
| -0.340000000000042 | 0.891 |  |  |
| -0.337500000000042 | 0.892 |  |  |
| -0.335000000000042 | 0.894 |  |  |
| -0.332500000000042 | 0.895 |  |  |
| -0.330000000000042 | 0.897 |  |  |
| -0.327500000000042 | 0.898 |  |  |
| -0.325000000000042 | 0.9 |  |  |
| -0.322500000000042 | 0.901 |  |  |
| -0.320000000000042 | 0.903 |  |  |
| -0.317500000000042 | 0.904 |  |  |
| -0.315000000000042 | 0.906 |  |  |
| -0.312500000000042 | 0.907 |  |  |
| -0.310000000000042 | 0.908 |  |  |
| -0.307500000000042 | 0.91 |  |  |
| -0.305000000000042 | 0.911 |  |  |
| -0.302500000000042 | 0.913 |  |  |
| -0.300000000000042 | 0.914 |  |  |
| -0.297500000000042 | 0.915 |  |  |
| -0.295000000000042 | 0.917 |  |  |
| -0.292500000000042 | 0.918 |  |  |
| -0.290000000000042 | 0.919 |  |  |
| -0.287500000000042 | 0.921 |  |  |
| -0.285000000000042 | 0.922 |  |  |
| -0.282500000000042 | 0.923 |  |  |
| -0.280000000000042 | 0.925 |  |  |
| -0.277500000000042 | 0.926 |  |  |
| -0.275000000000042 | 0.927 |  |  |
| -0.272500000000042 | 0.928 |  |  |
| -0.270000000000042 | 0.93 |  |  |
| -0.267500000000042 | 0.931 |  |  |
| -0.265000000000042 | 0.932 |  |  |
| -0.262500000000042 | 0.933 |  |  |
| -0.260000000000042 | 0.935 |  |  |
| -0.257500000000042 | 0.936 |  |  |
| -0.255000000000042 | 0.937 |  |  |
| -0.252500000000042 | 0.938 |  |  |
| -0.250000000000042 | 0.939 |  |  |
| -0.247500000000042 | 0.941 |  |  |
| -0.245000000000042 | 0.942 |  |  |
| -0.242500000000042 | 0.943 |  |  |
| -0.240000000000042 | 0.944 |  |  |
| -0.237500000000042 | 0.945 |  |  |
| -0.235000000000042 | 0.946 |  |  |
| -0.232500000000042 | 0.947 |  |  |
| -0.230000000000042 | 0.948 |  |  |
| -0.227500000000042 | 0.95 |  |  |
| -0.225000000000042 | 0.951 |  |  |
| -0.222500000000042 | 0.952 |  |  |
| -0.220000000000042 | 0.953 |  |  |
| -0.217500000000042 | 0.954 |  |  |
| -0.215000000000042 | 0.955 |  |  |
| -0.212500000000042 | 0.956 |  |  |
| -0.210000000000042 | 0.957 |  |  |
| -0.207500000000042 | 0.958 |  |  |
| -0.205000000000042 | 0.959 |  |  |
| -0.202500000000042 | 0.96 |  |  |
| -0.200000000000042 | 0.961 |  |  |
| -0.197500000000042 | 0.962 |  |  |
| -0.195000000000042 | 0.963 |  |  |
| -0.192500000000042 | 0.964 |  |  |
| -0.190000000000042 | 0.965 |  |  |
| -0.187500000000042 | 0.965 |  |  |
| -0.185000000000042 | 0.966 |  |  |
| -0.182500000000042 | 0.967 |  |  |
| -0.180000000000042 | 0.968 |  |  |
| -0.177500000000042 | 0.969 |  |  |
| -0.175000000000042 | 0.97 |  |  |
| -0.172500000000042 | 0.971 |  |  |
| -0.170000000000042 | 0.972 |  |  |
| -0.167500000000042 | 0.972 |  |  |
| -0.165000000000042 | 0.973 |  |  |
| -0.162500000000042 | 0.974 |  |  |
| -0.160000000000042 | 0.975 |  |  |
| -0.157500000000042 | 0.975 |  |  |
| -0.155000000000042 | 0.976 |  |  |
| -0.152500000000042 | 0.977 |  |  |
| -0.150000000000042 | 0.978 |  |  |
| -0.147500000000042 | 0.978 |  |  |
| -0.145000000000042 | 0.979 |  |  |
| -0.142500000000042 | 0.98 |  |  |
| -0.140000000000042 | 0.981 |  |  |
| -0.137500000000042 | 0.981 |  |  |
| -0.135000000000042 | 0.982 |  |  |
| -0.132500000000042 | 0.983 |  |  |
| -0.130000000000042 | 0.983 |  |  |
| -0.127500000000042 | 0.984 |  |  |
| -0.125000000000042 | 0.984 |  |  |
| -0.122500000000042 | 0.985 |  |  |
| -0.120000000000042 | 0.986 |  |  |
| -0.117500000000042 | 0.986 |  |  |
| -0.115000000000042 | 0.987 |  |  |
| -0.112500000000042 | 0.987 |  |  |
| -0.110000000000042 | 0.988 |  |  |
| -0.107500000000042 | 0.989 |  |  |
| -0.105000000000042 | 0.989 |  |  |
| -0.102500000000042 | 0.99 |  |  |
| -0.100000000000042 | 0.99 |  |  |
| -0.0975000000000422 | 0.991 |  |  |
| -0.0950000000000422 | 0.991 |  |  |
| -0.0925000000000422 | 0.991 |  |  |
| -0.0900000000000422 | 0.992 |  |  |
| -0.0875000000000422 | 0.992 |  |  |
| -0.0850000000000422 | 0.993 |  |  |
| -0.0825000000000422 | 0.993 |  |  |
| -0.0800000000000422 | 0.994 |  |  |
| -0.0775000000000422 | 0.994 |  |  |
| -0.0750000000000422 | 0.994 |  |  |
| -0.0725000000000422 | 0.995 |  |  |
| -0.0700000000000422 | 0.995 |  |  |
| -0.0675000000000422 | 0.995 |  |  |
| -0.0650000000000422 | 0.996 |  |  |
| -0.0625000000000422 | 0.996 |  |  |
| -0.0600000000000422 | 0.996 |  |  |
| -0.0575000000000422 | 0.997 |  |  |
| -0.0550000000000422 | 0.997 |  |  |
| -0.0525000000000422 | 0.997 |  |  |
| -0.0500000000000422 | 0.998 |  |  |
| -0.0475000000000422 | 0.998 |  |  |
| -0.0450000000000422 | 0.998 |  |  |
| -0.0425000000000422 | 0.998 |  |  |
| -0.0400000000000422 | 0.998 |  |  |
| -0.0375000000000422 | 0.999 |  |  |
| -0.0350000000000422 | 0.999 |  |  |
| -0.0325000000000422 | 0.999 |  |  |
| -0.0300000000000422 | 0.999 |  |  |
| -0.0275000000000422 | 0.999 |  |  |
| -0.0250000000000422 | 0.999 |  |  |
| -0.0225000000000422 | 0.999 |  |  |
| -0.0200000000000422 | 1 |  |  |
| -0.0175000000000422 | 1 |  |  |
| -0.0150000000000422 | 1 |  |  |
| -0.0125000000000422 | 1 |  |  |
| -0.0100000000000422 | 1 |  |  |
| -0.00750000000004222 | 1 |  |  |
| -0.00500000000004222 | 1 |  |  |
| -0.00250000000004222 | 1 |  |  |
| -4.22223020435375e-14 | 1 |  |  |
| 0.00249999999995778 | 1 |  |  |
| 0.00499999999995778 | 1 |  |  |
| 0.00749999999995778 | 1 |  |  |
| 0.00999999999995778 | 1 |  |  |
| 0.0124999999999578 | 1 |  |  |
| 0.0149999999999578 | 1 |  |  |
| 0.0174999999999578 | 1 |  |  |
| 0.0199999999999578 | 1 |  |  |
| 0.0224999999999578 | 0.999 |  |  |
| 0.0249999999999578 | 0.999 |  |  |
| 0.0274999999999578 | 0.999 |  |  |
| 0.0299999999999578 | 0.999 |  |  |
| 0.0324999999999578 | 0.999 |  |  |
| 0.0349999999999578 | 0.999 |  |  |
| 0.0374999999999578 | 0.999 |  |  |
| 0.0399999999999578 | 0.998 |  |  |
| 0.0424999999999578 | 0.998 |  |  |
| 0.0449999999999578 | 0.998 |  |  |
| 0.0474999999999578 | 0.998 |  |  |
| 0.0499999999999578 | 0.998 |  |  |
| 0.0524999999999578 | 0.997 |  |  |
| 0.0549999999999578 | 0.997 |  |  |
| 0.0574999999999578 | 0.997 |  |  |
| 0.0599999999999578 | 0.996 |  |  |
| 0.0624999999999578 | 0.996 |  |  |
| 0.0649999999999578 | 0.996 |  |  |
| 0.0674999999999578 | 0.995 |  |  |
| 0.0699999999999578 | 0.995 |  |  |
| 0.0724999999999578 | 0.995 |  |  |
| 0.0749999999999578 | 0.994 |  |  |
| 0.0774999999999578 | 0.994 |  |  |
| 0.0799999999999578 | 0.994 |  |  |
| 0.0824999999999578 | 0.993 |  |  |
| 0.0849999999999578 | 0.993 |  |  |
| 0.0874999999999578 | 0.992 |  |  |
| 0.0899999999999578 | 0.992 |  |  |
| 0.0924999999999578 | 0.991 |  |  |
| 0.0949999999999578 | 0.991 |  |  |
| 0.0974999999999578 | 0.991 |  |  |
| 0.0999999999999578 | 0.99 |  |  |
| 0.102499999999958 | 0.99 |  |  |
| 0.104999999999958 | 0.989 |  |  |
| 0.107499999999958 | 0.989 |  |  |
| 0.109999999999958 | 0.988 |  |  |
| 0.112499999999958 | 0.987 |  |  |
| 0.114999999999958 | 0.987 |  |  |
| 0.117499999999958 | 0.986 |  |  |
| 0.119999999999958 | 0.986 |  |  |
| 0.122499999999958 | 0.985 |  |  |
| 0.124999999999958 | 0.984 |  |  |
| 0.127499999999958 | 0.984 |  |  |
| 0.129999999999958 | 0.983 |  |  |
| 0.132499999999958 | 0.983 |  |  |
| 0.134999999999958 | 0.982 |  |  |
| 0.137499999999958 | 0.981 |  |  |
| 0.139999999999958 | 0.981 |  |  |
| 0.142499999999958 | 0.98 |  |  |
| 0.144999999999958 | 0.979 |  |  |
| 0.147499999999958 | 0.978 |  |  |
| 0.149999999999958 | 0.978 |  |  |
| 0.152499999999958 | 0.977 |  |  |
| 0.154999999999958 | 0.976 |  |  |
| 0.157499999999958 | 0.975 |  |  |
| 0.159999999999958 | 0.975 |  |  |
| 0.162499999999958 | 0.974 |  |  |
| 0.164999999999958 | 0.973 |  |  |
| 0.167499999999958 | 0.972 |  |  |
| 0.169999999999958 | 0.972 |  |  |
| 0.172499999999958 | 0.971 |  |  |
| 0.174999999999958 | 0.97 |  |  |
| 0.177499999999958 | 0.969 |  |  |
| 0.179999999999958 | 0.968 |  |  |
| 0.182499999999958 | 0.967 |  |  |
| 0.184999999999958 | 0.966 |  |  |
| 0.187499999999958 | 0.965 |  |  |
| 0.189999999999958 | 0.965 |  |  |
| 0.192499999999958 | 0.964 |  |  |
| 0.194999999999958 | 0.963 |  |  |
| 0.197499999999958 | 0.962 |  |  |
| 0.199999999999958 | 0.961 |  |  |
| 0.202499999999958 | 0.96 |  |  |
| 0.204999999999958 | 0.959 |  |  |
| 0.207499999999958 | 0.958 |  |  |
| 0.209999999999958 | 0.957 |  |  |
| 0.212499999999958 | 0.956 |  |  |
| 0.214999999999958 | 0.955 |  |  |
| 0.217499999999958 | 0.954 |  |  |
| 0.219999999999958 | 0.953 |  |  |
| 0.222499999999958 | 0.952 |  |  |
| 0.224999999999958 | 0.951 |  |  |
| 0.227499999999958 | 0.95 |  |  |
| 0.229999999999958 | 0.948 |  |  |
| 0.232499999999958 | 0.947 |  |  |
| 0.234999999999958 | 0.946 |  |  |
| 0.237499999999958 | 0.945 |  |  |
| 0.239999999999958 | 0.944 |  |  |
| 0.242499999999958 | 0.943 |  |  |
| 0.244999999999958 | 0.942 |  |  |
| 0.247499999999958 | 0.941 |  |  |
| 0.249999999999958 | 0.939 |  |  |
| 0.252499999999958 | 0.938 |  |  |
| 0.254999999999958 | 0.937 |  |  |
| 0.257499999999958 | 0.936 |  |  |
| 0.259999999999958 | 0.935 |  |  |
| 0.262499999999958 | 0.933 |  |  |
| 0.264999999999958 | 0.932 |  |  |
| 0.267499999999958 | 0.931 |  |  |
| 0.269999999999958 | 0.93 |  |  |
| 0.272499999999958 | 0.928 |  |  |
| 0.274999999999958 | 0.927 |  |  |
| 0.277499999999958 | 0.926 |  |  |
| 0.279999999999958 | 0.925 |  |  |
| 0.282499999999958 | 0.923 |  |  |
| 0.284999999999958 | 0.922 |  |  |
| 0.287499999999958 | 0.921 |  |  |
| 0.289999999999958 | 0.919 |  |  |
| 0.292499999999958 | 0.918 |  |  |
| 0.294999999999958 | 0.917 |  |  |
| 0.297499999999958 | 0.915 |  |  |
| 0.299999999999958 | 0.914 |  |  |
| 0.302499999999958 | 0.913 |  |  |
| 0.304999999999958 | 0.911 |  |  |
| 0.307499999999958 | 0.91 |  |  |
| 0.309999999999958 | 0.908 |  |  |
| 0.312499999999958 | 0.907 |  |  |
| 0.314999999999958 | 0.906 |  |  |
| 0.317499999999958 | 0.904 |  |  |
| 0.319999999999958 | 0.903 |  |  |
| 0.322499999999958 | 0.901 |  |  |
| 0.324999999999958 | 0.9 |  |  |
| 0.327499999999958 | 0.898 |  |  |
| 0.329999999999958 | 0.897 |  |  |
| 0.332499999999958 | 0.895 |  |  |
| 0.334999999999958 | 0.894 |  |  |
| 0.337499999999958 | 0.892 |  |  |
| 0.339999999999958 | 0.891 |  |  |
| 0.342499999999958 | 0.889 |  |  |
| 0.344999999999958 | 0.888 |  |  |
| 0.347499999999958 | 0.886 |  |  |
| 0.349999999999958 | 0.885 |  |  |
| 0.352499999999958 | 0.883 |  |  |
| 0.354999999999958 | 0.882 |  |  |
| 0.357499999999958 | 0.88 |  |  |
| 0.359999999999958 | 0.878 |  |  |
| 0.362499999999958 | 0.877 |  |  |
| 0.364999999999958 | 0.875 |  |  |
| 0.367499999999958 | 0.874 |  |  |
| 0.369999999999958 | 0.872 |  |  |
| 0.372499999999958 | 0.87 |  |  |
| 0.374999999999958 | 0.869 |  |  |
| 0.377499999999958 | 0.867 |  |  |
| 0.379999999999958 | 0.866 |  |  |
| 0.382499999999958 | 0.864 |  |  |
| 0.384999999999958 | 0.862 |  |  |
| 0.387499999999958 | 0.861 |  |  |
| 0.389999999999958 | 0.859 |  |  |
| 0.392499999999958 | 0.857 |  |  |
| 0.394999999999958 | 0.856 |  |  |
| 0.397499999999958 | 0.854 |  |  |
| 0.399999999999958 | 0.852 |  |  |
| 0.402499999999958 | 0.85 |  |  |
| 0.404999999999958 | 0.849 |  |  |
| 0.407499999999958 | 0.847 |  |  |
| 0.409999999999958 | 0.845 |  |  |
| 0.412499999999958 | 0.844 |  |  |
| 0.414999999999958 | 0.842 |  |  |
| 0.417499999999958 | 0.84 |  |  |
| 0.419999999999958 | 0.838 |  |  |
| 0.422499999999958 | 0.837 |  |  |
| 0.424999999999958 | 0.835 |  |  |
| 0.427499999999958 | 0.833 |  |  |
| 0.429999999999958 | 0.831 |  |  |
| 0.432499999999958 | 0.829 |  |  |
| 0.434999999999958 | 0.828 |  |  |
| 0.437499999999958 | 0.826 |  |  |
| 0.439999999999958 | 0.824 |  |  |
| 0.442499999999958 | 0.822 |  |  |
| 0.444999999999958 | 0.82 |  |  |
| 0.447499999999958 | 0.819 |  |  |
| 0.449999999999958 | 0.817 |  |  |
| 0.452499999999958 | 0.815 |  |  |
| 0.454999999999958 | 0.813 |  |  |
| 0.457499999999958 | 0.811 |  |  |
| 0.459999999999958 | 0.809 |  |  |
| 0.462499999999958 | 0.807 |  |  |
| 0.464999999999958 | 0.806 |  |  |
| 0.467499999999958 | 0.804 |  |  |
| 0.469999999999958 | 0.802 |  |  |
| 0.472499999999958 | 0.8 |  |  |
| 0.474999999999958 | 0.798 |  |  |
| 0.477499999999958 | 0.796 |  |  |
| 0.479999999999958 | 0.794 |  |  |
| 0.482499999999958 | 0.792 |  |  |
| 0.484999999999958 | 0.79 |  |  |
| 0.487499999999958 | 0.788 |  |  |
| 0.489999999999958 | 0.787 |  |  |
| 0.492499999999958 | 0.785 |  |  |
| 0.494999999999958 | 0.783 |  |  |
| 0.497499999999958 | 0.781 |  |  |
| 0.499999999999958 | 0.779 |  |  |
| 0.502499999999958 | 0.777 |  |  |
| 0.504999999999958 | 0.775 |  |  |
| 0.507499999999958 | 0.773 |  |  |
| 0.509999999999958 | 0.771 |  |  |
| 0.512499999999958 | 0.769 |  |  |
| 0.514999999999958 | 0.767 |  |  |
| 0.517499999999958 | 0.765 |  |  |
| 0.519999999999958 | 0.763 |  |  |
| 0.522499999999958 | 0.761 |  |  |
| 0.524999999999958 | 0.759 |  |  |
| 0.527499999999958 | 0.757 |  |  |
| 0.529999999999957 | 0.755 |  |  |
| 0.532499999999957 | 0.753 |  |  |
| 0.534999999999957 | 0.751 |  |  |
| 0.537499999999957 | 0.749 |  |  |
| 0.539999999999957 | 0.747 |  |  |
| 0.542499999999957 | 0.745 |  |  |
| 0.544999999999957 | 0.743 |  |  |
| 0.547499999999957 | 0.741 |  |  |
| 0.549999999999957 | 0.739 |  |  |
| 0.552499999999957 | 0.737 |  |  |
| 0.554999999999957 | 0.735 |  |  |
| 0.557499999999957 | 0.733 |  |  |
| 0.559999999999957 | 0.731 |  |  |
| 0.562499999999957 | 0.729 |  |  |
| 0.564999999999957 | 0.727 |  |  |
| 0.567499999999957 | 0.725 |  |  |
| 0.569999999999957 | 0.723 |  |  |
| 0.572499999999957 | 0.721 |  |  |
| 0.574999999999957 | 0.718 |  |  |
| 0.577499999999956 | 0.716 |  |  |
| 0.579999999999956 | 0.714 |  |  |
| 0.582499999999956 | 0.712 |  |  |
| 0.584999999999956 | 0.71 |  |  |
| 0.587499999999956 | 0.708 |  |  |
| 0.589999999999956 | 0.706 |  |  |
| 0.592499999999956 | 0.704 |  |  |
| 0.594999999999956 | 0.702 |  |  |
| 0.597499999999956 | 0.7 |  |  |
| 0.599999999999956 | 0.698 |  |  |
| 0.602499999999956 | 0.696 |  |  |
| 0.604999999999956 | 0.693 |  |  |
| 0.607499999999956 | 0.691 |  |  |
| 0.609999999999956 | 0.689 |  |  |
| 0.612499999999956 | 0.687 |  |  |
| 0.614999999999956 | 0.685 |  |  |
| 0.617499999999956 | 0.683 |  |  |
| 0.619999999999955 | 0.681 |  |  |
| 0.622499999999955 | 0.679 |  |  |
| 0.624999999999955 | 0.677 |  |  |
| 0.627499999999955 | 0.675 |  |  |
| 0.629999999999955 | 0.672 |  |  |
| 0.632499999999955 | 0.67 |  |  |
| 0.634999999999955 | 0.668 |  |  |
| 0.637499999999955 | 0.666 |  |  |
| 0.639999999999955 | 0.664 |  |  |
| 0.642499999999955 | 0.662 |  |  |
| 0.644999999999955 | 0.66 |  |  |
| 0.647499999999955 | 0.658 |  |  |
| 0.649999999999955 | 0.655 |  |  |
| 0.652499999999955 | 0.653 |  |  |
| 0.654999999999955 | 0.651 |  |  |
| 0.657499999999955 | 0.649 |  |  |
| 0.659999999999955 | 0.647 |  |  |
| 0.662499999999955 | 0.645 |  |  |
| 0.664999999999955 | 0.643 |  |  |
| 0.667499999999954 | 0.64 |  |  |
| 0.669999999999954 | 0.638 |  |  |
| 0.672499999999954 | 0.636 |  |  |
| 0.674999999999954 | 0.634 |  |  |
| 0.677499999999954 | 0.632 |  |  |
| 0.679999999999954 | 0.63 |  |  |
| 0.682499999999954 | 0.628 |  |  |
| 0.684999999999954 | 0.625 |  |  |
| 0.687499999999954 | 0.623 |  |  |
| 0.689999999999954 | 0.621 |  |  |
| 0.692499999999954 | 0.619 |  |  |
| 0.694999999999954 | 0.617 |  |  |
| 0.697499999999954 | 0.615 |  |  |
| 0.699999999999954 | 0.613 |  |  |
| 0.702499999999954 | 0.61 |  |  |
| 0.704999999999954 | 0.608 |  |  |
| 0.707499999999954 | 0.606 |  |  |
| 0.709999999999954 | 0.604 |  |  |
| 0.712499999999954 | 0.602 |  |  |
| 0.714999999999953 | 0.6 |  |  |
| 0.717499999999953 | 0.598 |  |  |
| 0.719999999999953 | 0.595 |  |  |
| 0.722499999999953 | 0.593 |  |  |
| 0.724999999999953 | 0.591 |  |  |
| 0.727499999999953 | 0.589 |  |  |
| 0.729999999999953 | 0.587 |  |  |
| 0.732499999999953 | 0.585 |  |  |
| 0.734999999999953 | 0.583 |  |  |
| 0.737499999999953 | 0.58 |  |  |
| 0.739999999999953 | 0.578 |  |  |
| 0.742499999999953 | 0.576 |  |  |
| 0.744999999999953 | 0.574 |  |  |
| 0.747499999999953 | 0.572 |  |  |
| 0.749999999999953 | 0.57 |  |  |
| 0.752499999999953 | 0.568 |  |  |
| 0.754999999999953 | 0.566 |  |  |
| 0.757499999999953 | 0.563 |  |  |
| 0.759999999999953 | 0.561 |  |  |
| 0.762499999999952 | 0.559 |  |  |
| 0.764999999999952 | 0.557 |  |  |
| 0.767499999999952 | 0.555 |  |  |
| 0.769999999999952 | 0.553 |  |  |
| 0.772499999999952 | 0.551 |  |  |
| 0.774999999999952 | 0.548 |  |  |
| 0.777499999999952 | 0.546 |  |  |
| 0.779999999999952 | 0.544 |  |  |
| 0.782499999999952 | 0.542 |  |  |
| 0.784999999999952 | 0.54 |  |  |
| 0.787499999999952 | 0.538 |  |  |
| 0.789999999999952 | 0.536 |  |  |
| 0.792499999999952 | 0.534 |  |  |
| 0.794999999999952 | 0.532 |  |  |
| 0.797499999999952 | 0.529 |  |  |
| 0.799999999999952 | 0.527 |  |  |
| 0.802499999999952 | 0.525 |  |  |
| 0.804999999999952 | 0.523 |  |  |
| 0.807499999999952 | 0.521 |  |  |
| 0.809999999999951 | 0.519 |  |  |
| 0.812499999999951 | 0.517 |  |  |
| 0.814999999999951 | 0.515 |  |  |
| 0.817499999999951 | 0.513 |  |  |
| 0.819999999999951 | 0.51 |  |  |
| 0.822499999999951 | 0.508 |  |  |
| 0.824999999999951 | 0.506 |  |  |
| 0.827499999999951 | 0.504 |  |  |
| 0.829999999999951 | 0.502 |  |  |
| 0.832499999999951 | 0.5 |  |  |
| 0.834999999999951 | 0.498 |  |  |
| 0.837499999999951 | 0.496 |  |  |
| 0.839999999999951 | 0.494 |  |  |
| 0.842499999999951 | 0.492 |  |  |
| 0.844999999999951 | 0.49 |  |  |
| 0.847499999999951 | 0.488 |  |  |
| 0.849999999999951 | 0.486 |  |  |
| 0.852499999999951 | 0.483 |  |  |
| 0.854999999999951 | 0.481 |  |  |
| 0.85749999999995 | 0.479 |  |  |
| 0.85999999999995 | 0.477 |  |  |
| 0.86249999999995 | 0.475 |  |  |
| 0.86499999999995 | 0.473 |  |  |
| 0.86749999999995 | 0.471 |  |  |
| 0.86999999999995 | 0.469 |  |  |
| 0.87249999999995 | 0.467 |  |  |
| 0.87499999999995 | 0.465 |  |  |
| 0.87749999999995 | 0.463 |  |  |
| 0.87999999999995 | 0.461 |  |  |
| 0.88249999999995 | 0.459 |  |  |
| 0.88499999999995 | 0.457 |  |  |
| 0.88749999999995 | 0.455 |  |  |
| 0.88999999999995 | 0.453 |  |  |
| 0.89249999999995 | 0.451 |  |  |
| 0.89499999999995 | 0.449 |  |  |
| 0.89749999999995 | 0.447 |  |  |
| 0.89999999999995 | 0.445 |  |  |
| 0.90249999999995 | 0.443 |  |  |
| 0.904999999999949 | 0.441 |  |  |
| 0.907499999999949 | 0.439 |  |  |
| 0.909999999999949 | 0.437 |  |  |
| 0.912499999999949 | 0.435 |  |  |
| 0.914999999999949 | 0.433 |  |  |
| 0.917499999999949 | 0.431 |  |  |
| 0.919999999999949 | 0.429 |  |  |
| 0.922499999999949 | 0.427 |  |  |
| 0.924999999999949 | 0.425 |  |  |
| 0.927499999999949 | 0.423 |  |  |
| 0.929999999999949 | 0.421 |  |  |
| 0.932499999999949 | 0.419 |  |  |
| 0.934999999999949 | 0.417 |  |  |
| 0.937499999999949 | 0.415 |  |  |
| 0.939999999999949 | 0.413 |  |  |
| 0.942499999999949 | 0.411 |  |  |
| 0.944999999999949 | 0.409 |  |  |
| 0.947499999999949 | 0.407 |  |  |
| 0.949999999999949 | 0.406 |  |  |
| 0.952499999999948 | 0.404 |  |  |
| 0.954999999999948 | 0.402 |  |  |
| 0.957499999999948 | 0.4 |  |  |
| 0.959999999999948 | 0.398 |  |  |
| 0.962499999999948 | 0.396 |  |  |
| 0.964999999999948 | 0.394 |  |  |
| 0.967499999999948 | 0.392 |  |  |
| 0.969999999999948 | 0.39 |  |  |
| 0.972499999999948 | 0.388 |  |  |
| 0.974999999999948 | 0.386 |  |  |
| 0.977499999999948 | 0.385 |  |  |
| 0.979999999999948 | 0.383 |  |  |
| 0.982499999999948 | 0.381 |  |  |
| 0.984999999999948 | 0.379 |  |  |
| 0.987499999999948 | 0.377 |  |  |
| 0.989999999999948 | 0.375 |  |  |
| 0.992499999999948 | 0.373 |  |  |
| 0.994999999999948 | 0.372 |  |  |
| 0.997499999999947 | 0.37 |  |  |
| 0.999999999999947 | 0.368 |  |  |
| 1.002499999999948 | 0.366 |  |  |
| 1.004999999999947 | 0.364 |  |  |
| 1.007499999999947 | 0.362 |  |  |
| 1.009999999999947 | 0.361 |  |  |
| 1.012499999999947 | 0.359 |  |  |
| 1.014999999999947 | 0.357 |  |  |
| 1.017499999999947 | 0.355 |  |  |
| 1.019999999999947 | 0.353 |  |  |
| 1.022499999999947 | 0.352 |  |  |
| 1.024999999999947 | 0.35 |  |  |
| 1.027499999999947 | 0.348 |  |  |
| 1.029999999999947 | 0.346 |  |  |
| 1.032499999999947 | 0.344 |  |  |
| 1.034999999999947 | 0.343 |  |  |
| 1.037499999999947 | 0.341 |  |  |
| 1.039999999999947 | 0.339 |  |  |
| 1.042499999999947 | 0.337 |  |  |
| 1.044999999999947 | 0.336 |  |  |
| 1.047499999999947 | 0.334 |  |  |
| 1.049999999999947 | 0.332 |  |  |
| 1.052499999999946 | 0.33 |  |  |
| 1.054999999999946 | 0.329 |  |  |
| 1.057499999999946 | 0.327 |  |  |
| 1.059999999999946 | 0.325 |  |  |
| 1.062499999999946 | 0.323 |  |  |
| 1.064999999999946 | 0.322 |  |  |
| 1.067499999999946 | 0.32 |  |  |
| 1.069999999999946 | 0.318 |  |  |
| 1.072499999999946 | 0.317 |  |  |
| 1.074999999999946 | 0.315 |  |  |
| 1.077499999999946 | 0.313 |  |  |
| 1.079999999999946 | 0.311 |  |  |
| 1.082499999999946 | 0.31 |  |  |
| 1.084999999999946 | 0.308 |  |  |
| 1.087499999999946 | 0.306 |  |  |
| 1.089999999999946 | 0.305 |  |  |
| 1.092499999999946 | 0.303 |  |  |
| 1.094999999999946 | 0.301 |  |  |
| 1.097499999999945 | 0.3 |  |  |
| 1.099999999999945 | 0.298 |  |  |
| 1.102499999999945 | 0.297 |  |  |
| 1.104999999999945 | 0.295 |  |  |
| 1.107499999999945 | 0.293 |  |  |
| 1.109999999999945 | 0.292 |  |  |
| 1.112499999999945 | 0.29 |  |  |
| 1.114999999999945 | 0.288 |  |  |
| 1.117499999999945 | 0.287 |  |  |
| 1.119999999999945 | 0.285 |  |  |
| 1.122499999999945 | 0.284 |  |  |
| 1.124999999999945 | 0.282 |  |  |
| 1.127499999999945 | 0.28 |  |  |
| 1.129999999999945 | 0.279 |  |  |
| 1.132499999999945 | 0.277 |  |  |
| 1.134999999999945 | 0.276 |  |  |
| 1.137499999999945 | 0.274 |  |  |
| 1.139999999999945 | 0.273 |  |  |
| 1.142499999999945 | 0.271 |  |  |
| 1.144999999999944 | 0.27 |  |  |
| 1.147499999999944 | 0.268 |  |  |
| 1.149999999999944 | 0.266 |  |  |
| 1.152499999999944 | 0.265 |  |  |
| 1.154999999999944 | 0.263 |  |  |
| 1.157499999999944 | 0.262 |  |  |
| 1.159999999999944 | 0.26 |  |  |
| 1.162499999999944 | 0.259 |  |  |
| 1.164999999999944 | 0.257 |  |  |
| 1.167499999999944 | 0.256 |  |  |
| 1.169999999999944 | 0.254 |  |  |
| 1.172499999999944 | 0.253 |  |  |
| 1.174999999999944 | 0.251 |  |  |
| 1.177499999999944 | 0.25 |  |  |
| 1.179999999999944 | 0.248 |  |  |
| 1.182499999999944 | 0.247 |  |  |
| 1.184999999999944 | 0.246 |  |  |
| 1.187499999999944 | 0.244 |  |  |
| 1.189999999999944 | 0.243 |  |  |
| 1.192499999999943 | 0.241 |  |  |
| 1.194999999999943 | 0.24 |  |  |
| 1.197499999999943 | 0.238 |  |  |
| 1.199999999999943 | 0.237 |  |  |
| 1.202499999999943 | 0.236 |  |  |
| 1.204999999999943 | 0.234 |  |  |
| 1.207499999999943 | 0.233 |  |  |
| 1.209999999999943 | 0.231 |  |  |
| 1.212499999999943 | 0.23 |  |  |
| 1.214999999999943 | 0.228 |  |  |
| 1.217499999999943 | 0.227 |  |  |
| 1.219999999999943 | 0.226 |  |  |
| 1.222499999999943 | 0.224 |  |  |
| 1.224999999999943 | 0.223 |  |  |
| 1.227499999999943 | 0.222 |  |  |
| 1.229999999999943 | 0.22 |  |  |
| 1.232499999999943 | 0.219 |  |  |
| 1.234999999999943 | 0.218 |  |  |
| 1.237499999999943 | 0.216 |  |  |
| 1.239999999999942 | 0.215 |  |  |
| 1.242499999999942 | 0.214 |  |  |
| 1.244999999999942 | 0.212 |  |  |
| 1.247499999999942 | 0.211 |  |  |
| 1.249999999999942 | 0.21 |  |  |
| 1.252499999999942 | 0.208 |  |  |
| 1.254999999999942 | 0.207 |  |  |
| 1.257499999999942 | 0.206 |  |  |
| 1.259999999999942 | 0.204 |  |  |
| 1.262499999999942 | 0.203 |  |  |
| 1.264999999999942 | 0.202 |  |  |
| 1.267499999999942 | 0.201 |  |  |
| 1.269999999999942 | 0.199 |  |  |
| 1.272499999999942 | 0.198 |  |  |
| 1.274999999999942 | 0.197 |  |  |
| 1.277499999999942 | 0.196 |  |  |
| 1.279999999999942 | 0.194 |  |  |
| 1.282499999999942 | 0.193 |  |  |
| 1.284999999999941 | 0.192 |  |  |
| 1.287499999999941 | 0.191 |  |  |
| 1.289999999999941 | 0.189 |  |  |
| 1.292499999999941 | 0.188 |  |  |
| 1.294999999999941 | 0.187 |  |  |
| 1.297499999999941 | 0.186 |  |  |
| 1.299999999999941 | 0.185 |  |  |
| 1.302499999999941 | 0.183 |  |  |
| 1.304999999999941 | 0.182 |  |  |
| 1.307499999999941 | 0.181 |  |  |
| 1.309999999999941 | 0.18 |  |  |
| 1.312499999999941 | 0.179 |  |  |
| 1.314999999999941 | 0.177 |  |  |
| 1.317499999999941 | 0.176 |  |  |
| 1.319999999999941 | 0.175 |  |  |
| 1.322499999999941 | 0.174 |  |  |
| 1.324999999999941 | 0.173 |  |  |
| 1.327499999999941 | 0.172 |  |  |
| 1.329999999999941 | 0.171 |  |  |
| 1.33249999999994 | 0.169 |  |  |
| 1.33499999999994 | 0.168 |  |  |
| 1.33749999999994 | 0.167 |  |  |
| 1.33999999999994 | 0.166 |  |  |
| 1.34249999999994 | 0.165 |  |  |
| 1.34499999999994 | 0.164 |  |  |
| 1.34749999999994 | 0.163 |  |  |
| 1.34999999999994 | 0.162 |  |  |
| 1.35249999999994 | 0.161 |  |  |
| 1.35499999999994 | 0.159 |  |  |
| 1.35749999999994 | 0.158 |  |  |
| 1.35999999999994 | 0.157 |  |  |
| 1.36249999999994 | 0.156 |  |  |
| 1.36499999999994 | 0.155 |  |  |
| 1.36749999999994 | 0.154 |  |  |
| 1.36999999999994 | 0.153 |  |  |
| 1.37249999999994 | 0.152 |  |  |
| 1.37499999999994 | 0.151 |  |  |
| 1.377499999999939 | 0.15 |  |  |
| 1.379999999999939 | 0.149 |  |  |
| 1.382499999999939 | 0.148 |  |  |
| 1.384999999999939 | 0.147 |  |  |
| 1.387499999999939 | 0.146 |  |  |
| 1.389999999999939 | 0.145 |  |  |
| 1.392499999999939 | 0.144 |  |  |
| 1.394999999999939 | 0.143 |  |  |
| 1.397499999999939 | 0.142 |  |  |
| 1.399999999999939 | 0.141 |  |  |
| 1.402499999999939 | 0.14 |  |  |
| 1.404999999999939 | 0.139 |  |  |
| 1.407499999999939 | 0.138 |  |  |
| 1.409999999999939 | 0.137 |  |  |
| 1.412499999999939 | 0.136 |  |  |
| 1.414999999999939 | 0.135 |  |  |
| 1.417499999999939 | 0.134 |  |  |
| 1.419999999999939 | 0.133 |  |  |
| 1.422499999999939 | 0.132 |  |  |
| 1.424999999999939 | 0.131 |  |  |
| 1.427499999999938 | 0.13 |  |  |
| 1.429999999999938 | 0.129 |  |  |
| 1.432499999999938 | 0.128 |  |  |
| 1.434999999999938 | 0.128 |  |  |
| 1.437499999999938 | 0.127 |  |  |
| 1.439999999999938 | 0.126 |  |  |
| 1.442499999999938 | 0.125 |  |  |
| 1.444999999999938 | 0.124 |  |  |
| 1.447499999999938 | 0.123 |  |  |
| 1.449999999999938 | 0.122 |  |  |
| 1.452499999999938 | 0.121 |  |  |
| 1.454999999999938 | 0.12 |  |  |
| 1.457499999999938 | 0.12 |  |  |
| 1.459999999999938 | 0.119 |  |  |
| 1.462499999999938 | 0.118 |  |  |
| 1.464999999999938 | 0.117 |  |  |
| 1.467499999999938 | 0.116 |  |  |
| 1.469999999999938 | 0.115 |  |  |
| 1.472499999999937 | 0.114 |  |  |
| 1.474999999999937 | 0.114 |  |  |
| 1.477499999999937 | 0.113 |  |  |
| 1.479999999999937 | 0.112 |  |  |
| 1.482499999999937 | 0.111 |  |  |
| 1.484999999999937 | 0.11 |  |  |
| 1.487499999999937 | 0.109 |  |  |
| 1.489999999999937 | 0.109 |  |  |
| 1.492499999999937 | 0.108 |  |  |
| 1.494999999999937 | 0.107 |  |  |
| 1.497499999999937 | 0.106 |  |  |
| 1.499999999999937 | 0.105 |  |  |
| 1.502499999999937 | 0.105 |  |  |
| 1.504999999999937 | 0.104 |  |  |
| 1.507499999999937 | 0.103 |  |  |
| 1.509999999999937 | 0.102 |  |  |
| 1.512499999999937 | 0.102 |  |  |
| 1.514999999999937 | 0.101 |  |  |
| 1.517499999999937 | 0.1 |  |  |
| 1.519999999999937 | 0.099 |  |  |
| 1.522499999999936 | 0.098 |  |  |
| 1.524999999999936 | 0.098 |  |  |
| 1.527499999999936 | 0.097 |  |  |
| 1.529999999999936 | 0.096 |  |  |
| 1.532499999999936 | 0.096 |  |  |
| 1.534999999999936 | 0.095 |  |  |
| 1.537499999999936 | 0.094 |  |  |
| 1.539999999999936 | 0.093 |  |  |
| 1.542499999999936 | 0.093 |  |  |
| 1.544999999999936 | 0.092 |  |  |
| 1.547499999999936 | 0.091 |  |  |
| 1.549999999999936 | 0.09 |  |  |
| 1.552499999999936 | 0.09 |  |  |
| 1.554999999999936 | 0.089 |  |  |
| 1.557499999999936 | 0.088 |  |  |
| 1.559999999999936 | 0.088 |  |  |
| 1.562499999999936 | 0.087 |  |  |
| 1.564999999999936 | 0.086 |  |  |
| 1.567499999999935 | 0.086 |  |  |
| 1.569999999999935 | 0.085 |  |  |
| 1.572499999999935 | 0.084 |  |  |
| 1.574999999999935 | 0.084 |  |  |
| 1.577499999999935 | 0.083 |  |  |
| 1.579999999999935 | 0.082 |  |  |
| 1.582499999999935 | 0.082 |  |  |
| 1.584999999999935 | 0.081 |  |  |
| 1.587499999999935 | 0.08 |  |  |
| 1.589999999999935 | 0.08 |  |  |
| 1.592499999999935 | 0.079 |  |  |
| 1.594999999999935 | 0.079 |  |  |
| 1.597499999999935 | 0.078 |  |  |
| 1.599999999999935 | 0.077 |  |  |
| 1.602499999999935 | 0.077 |  |  |
| 1.604999999999935 | 0.076 |  |  |
| 1.607499999999935 | 0.075 |  |  |
| 1.609999999999935 | 0.075 |  |  |
| 1.612499999999934 | 0.074 |  |  |
| 1.614999999999934 | 0.074 |  |  |
| 1.617499999999934 | 0.073 |  |  |
| 1.619999999999934 | 0.072 |  |  |
| 1.622499999999934 | 0.072 |  |  |
| 1.624999999999934 | 0.071 |  |  |
| 1.627499999999934 | 0.071 |  |  |
| 1.629999999999934 | 0.07 |  |  |
| 1.632499999999934 | 0.07 |  |  |
| 1.634999999999934 | 0.069 |  |  |
| 1.637499999999934 | 0.068 |  |  |
| 1.639999999999934 | 0.068 |  |  |
| 1.642499999999934 | 0.067 |  |  |
| 1.644999999999934 | 0.067 |  |  |
| 1.647499999999934 | 0.066 |  |  |
| 1.649999999999934 | 0.066 |  |  |
| 1.652499999999934 | 0.065 |  |  |
| 1.654999999999934 | 0.065 |  |  |
| 1.657499999999933 | 0.064 |  |  |
| 1.659999999999933 | 0.064 |  |  |
| 1.662499999999933 | 0.063 |  |  |
| 1.664999999999933 | 0.063 |  |  |
| 1.667499999999933 | 0.062 |  |  |
| 1.669999999999933 | 0.061 |  |  |
| 1.672499999999933 | 0.061 |  |  |
| 1.674999999999933 | 0.06 |  |  |
| 1.677499999999933 | 0.06 |  |  |
| 1.679999999999933 | 0.059 |  |  |
| 1.682499999999933 | 0.059 |  |  |
| 1.684999999999933 | 0.058 |  |  |
| 1.687499999999933 | 0.058 |  |  |
| 1.689999999999933 | 0.057 |  |  |
| 1.692499999999933 | 0.057 |  |  |
| 1.694999999999933 | 0.057 |  |  |
| 1.697499999999933 | 0.056 |  |  |
| 1.699999999999933 | 0.056 |  |  |
| 1.702499999999933 | 0.055 |  |  |
| 1.704999999999933 | 0.055 |  |  |
| 1.707499999999932 | 0.054 |  |  |
| 1.709999999999932 | 0.054 |  |  |
| 1.712499999999932 | 0.053 |  |  |
| 1.714999999999932 | 0.053 |  |  |
| 1.717499999999932 | 0.052 |  |  |
| 1.719999999999932 | 0.052 |  |  |
| 1.722499999999932 | 0.051 |  |  |
| 1.724999999999932 | 0.051 |  |  |
| 1.727499999999932 | 0.051 |  |  |
| 1.729999999999932 | 0.05 |  |  |
| 1.732499999999932 | 0.05 |  |  |
| 1.734999999999932 | 0.049 |  |  |
| 1.737499999999932 | 0.049 |  |  |
| 1.739999999999932 | 0.048 |  |  |
| 1.742499999999932 | 0.048 |  |  |
| 1.744999999999932 | 0.048 |  |  |
| 1.747499999999932 | 0.047 |  |  |
| 1.749999999999932 | 0.047 |  |  |
| 1.752499999999931 | 0.046 |  |  |
| 1.754999999999931 | 0.046 |  |  |
| 1.757499999999931 | 0.046 |  |  |
| 1.759999999999931 | 0.045 |  |  |
| 1.762499999999931 | 0.045 |  |  |
| 1.764999999999931 | 0.044 |  |  |
| 1.767499999999931 | 0.044 |  |  |
| 1.769999999999931 | 0.044 |  |  |
| 1.772499999999931 | 0.043 |  |  |
| 1.774999999999931 | 0.043 |  |  |
| 1.777499999999931 | 0.042 |  |  |
| 1.779999999999931 | 0.042 |  |  |
| 1.782499999999931 | 0.042 |  |  |
| 1.784999999999931 | 0.041 |  |  |
| 1.787499999999931 | 0.041 |  |  |
| 1.789999999999931 | 0.041 |  |  |
| 1.792499999999931 | 0.04 |  |  |
| 1.794999999999931 | 0.04 |  |  |
| 1.797499999999931 | 0.04 |  |  |
| 1.79999999999993 | 0.039 |  |  |
| 1.80249999999993 | 0.039 |  |  |
| 1.80499999999993 | 0.038 |  |  |
| 1.80749999999993 | 0.038 |  |  |
| 1.80999999999993 | 0.038 |  |  |
| 1.81249999999993 | 0.037 |  |  |
| 1.81499999999993 | 0.037 |  |  |
| 1.81749999999993 | 0.037 |  |  |
| 1.81999999999993 | 0.036 |  |  |
| 1.82249999999993 | 0.036 |  |  |
| 1.82499999999993 | 0.036 |  |  |
| 1.82749999999993 | 0.035 |  |  |
| 1.82999999999993 | 0.035 |  |  |
| 1.83249999999993 | 0.035 |  |  |
| 1.83499999999993 | 0.034 |  |  |
| 1.83749999999993 | 0.034 |  |  |
| 1.83999999999993 | 0.034 |  |  |
| 1.84249999999993 | 0.034 |  |  |
| 1.84499999999993 | 0.033 |  |  |
| 1.847499999999929 | 0.033 |  |  |
| 1.849999999999929 | 0.033 |  |  |
| 1.852499999999929 | 0.032 |  |  |
| 1.854999999999929 | 0.032 |  |  |
| 1.857499999999929 | 0.032 |  |  |
| 1.859999999999929 | 0.031 |  |  |
| 1.862499999999929 | 0.031 |  |  |
| 1.864999999999929 | 0.031 |  |  |
| 1.867499999999929 | 0.031 |  |  |
| 1.869999999999929 | 0.03 |  |  |
| 1.872499999999929 | 0.03 |  |  |
| 1.874999999999929 | 0.03 |  |  |
| 1.877499999999929 | 0.029 |  |  |
| 1.879999999999929 | 0.029 |  |  |
| 1.882499999999929 | 0.029 |  |  |
| 1.884999999999929 | 0.029 |  |  |
| 1.887499999999929 | 0.028 |  |  |
| 1.889999999999929 | 0.028 |  |  |
| 1.892499999999929 | 0.028 |  |  |
| 1.894999999999928 | 0.028 |  |  |
| 1.897499999999928 | 0.027 |  |  |
| 1.899999999999928 | 0.027 |  |  |
| 1.902499999999928 | 0.027 |  |  |
| 1.904999999999928 | 0.027 |  |  |
| 1.907499999999928 | 0.026 |  |  |
| 1.909999999999928 | 0.026 |  |  |
| 1.912499999999928 | 0.026 |  |  |
| 1.914999999999928 | 0.026 |  |  |
| 1.917499999999928 | 0.025 |  |  |
| 1.919999999999928 | 0.025 |  |  |
| 1.922499999999928 | 0.025 |  |  |
| 1.924999999999928 | 0.025 |  |  |
| 1.927499999999928 | 0.024 |  |  |
| 1.929999999999928 | 0.024 |  |  |
| 1.932499999999928 | 0.024 |  |  |
| 1.934999999999928 | 0.024 |  |  |
| 1.937499999999928 | 0.023 |  |  |
| 1.939999999999928 | 0.023 |  |  |
| 1.942499999999927 | 0.023 |  |  |
| 1.944999999999927 | 0.023 |  |  |
| 1.947499999999927 | 0.023 |  |  |
| 1.949999999999927 | 0.022 |  |  |
| 1.952499999999927 | 0.022 |  |  |
| 1.954999999999927 | 0.022 |  |  |
| 1.957499999999927 | 0.022 |  |  |
| 1.959999999999927 | 0.021 |  |  |
| 1.962499999999927 | 0.021 |  |  |
| 1.964999999999927 | 0.021 |  |  |
| 1.967499999999927 | 0.021 |  |  |
| 1.969999999999927 | 0.021 |  |  |
| 1.972499999999927 | 0.02 |  |  |
| 1.974999999999927 | 0.02 |  |  |
| 1.977499999999927 | 0.02 |  |  |
| 1.979999999999927 | 0.02 |  |  |
| 1.982499999999927 | 0.02 |  |  |
| 1.984999999999927 | 0.019 |  |  |
| 1.987499999999927 | 0.019 |  |  |
| 1.989999999999926 | 0.019 |  |  |
| 1.992499999999926 | 0.019 |  |  |
| 1.994999999999926 | 0.019 |  |  |
| 1.997499999999926 | 0.018 |  |  |
| 1.999999999999926 | 0.018 |  |  |
| 2.002499999999926 | 0.018 |  |  |
| 2.004999999999926 | 0.018 |  |  |
| 2.007499999999926 | 0.018 |  |  |
| 2.009999999999926 | 0.018 |  |  |
| 2.012499999999926 | 0.017 |  |  |
| 2.014999999999926 | 0.017 |  |  |
| 2.017499999999926 | 0.017 |  |  |
| 2.019999999999926 | 0.017 |  |  |
| 2.022499999999926 | 0.017 |  |  |
| 2.024999999999926 | 0.017 |  |  |
| 2.027499999999926 | 0.016 |  |  |
| 2.029999999999926 | 0.016 |  |  |
| 2.032499999999926 | 0.016 |  |  |
| 2.034999999999926 | 0.016 |  |  |
| 2.037499999999925 | 0.016 |  |  |
| 2.039999999999925 | 0.016 |  |  |
| 2.042499999999925 | 0.015 |  |  |
| 2.044999999999925 | 0.015 |  |  |
| 2.047499999999925 | 0.015 |  |  |
| 2.049999999999925 | 0.015 |  |  |
| 2.052499999999925 | 0.015 |  |  |
| 2.054999999999925 | 0.015 |  |  |
| 2.057499999999925 | 0.015 |  |  |
| 2.059999999999925 | 0.014 |  |  |
| 2.062499999999925 | 0.014 |  |  |
| 2.064999999999925 | 0.014 |  |  |
| 2.067499999999925 | 0.014 |  |  |
| 2.069999999999925 | 0.014 |  |  |
| 2.072499999999925 | 0.014 |  |  |
| 2.074999999999925 | 0.013 |  |  |
| 2.077499999999925 | 0.013 |  |  |
| 2.079999999999925 | 0.013 |  |  |
| 2.082499999999925 | 0.013 |  |  |
| 2.084999999999924 | 0.013 |  |  |
| 2.087499999999924 | 0.013 |  |  |
| 2.089999999999924 | 0.013 |  |  |
| 2.092499999999924 | 0.013 |  |  |
| 2.094999999999924 | 0.012 |  |  |
| 2.097499999999924 | 0.012 |  |  |
| 2.099999999999924 | 0.012 |  |  |
| 2.102499999999924 | 0.012 |  |  |
| 2.104999999999924 | 0.012 |  |  |
| 2.107499999999924 | 0.012 |  |  |
| 2.109999999999924 | 0.012 |  |  |
| 2.112499999999924 | 0.012 |  |  |
| 2.114999999999924 | 0.011 |  |  |
| 2.117499999999924 | 0.011 |  |  |
| 2.119999999999924 | 0.011 |  |  |
| 2.122499999999924 | 0.011 |  |  |
| 2.124999999999924 | 0.011 |  |  |
| 2.127499999999924 | 0.011 |  |  |
| 2.129999999999923 | 0.011 |  |  |
| 2.132499999999923 | 0.011 |  |  |
| 2.134999999999923 | 0.01 |  |  |
| 2.137499999999923 | 0.01 |  |  |
| 2.139999999999923 | 0.01 |  |  |
| 2.142499999999923 | 0.01 |  |  |
| 2.144999999999923 | 0.01 |  |  |
| 2.147499999999923 | 0.01 |  |  |
| 2.149999999999923 | 0.01 |  |  |
| 2.152499999999923 | 0.01 |  |  |
| 2.154999999999923 | 0.01 |  |  |
| 2.157499999999923 | 0.01 |  |  |
| 2.159999999999923 | 0.009 |  |  |
| 2.162499999999923 | 0.009 |  |  |
| 2.164999999999923 | 0.009 |  |  |
| 2.167499999999923 | 0.009 |  |  |
| 2.169999999999923 | 0.009 |  |  |
| 2.172499999999923 | 0.009 |  |  |
| 2.174999999999923 | 0.009 |  |  |
| 2.177499999999922 | 0.009 |  |  |
| 2.179999999999922 | 0.009 |  |  |
| 2.182499999999922 | 0.009 |  |  |
| 2.184999999999922 | 0.008 |  |  |
| 2.187499999999922 | 0.008 |  |  |
| 2.189999999999922 | 0.008 |  |  |
| 2.192499999999922 | 0.008 |  |  |
| 2.194999999999922 | 0.008 |  |  |
| 2.197499999999922 | 0.008 |  |  |
| 2.199999999999922 | 0.008 |  |  |
| 2.202499999999922 | 0.008 |  |  |
| 2.204999999999922 | 0.008 |  |  |
| 2.207499999999922 | 0.008 |  |  |
| 2.209999999999922 | 0.008 |  |  |
| 2.212499999999922 | 0.007 |  |  |
| 2.214999999999922 | 0.007 |  |  |
| 2.217499999999922 | 0.007 |  |  |
| 2.219999999999922 | 0.007 |  |  |
| 2.222499999999922 | 0.007 |  |  |
| 2.224999999999921 | 0.007 |  |  |
| 2.227499999999921 | 0.007 |  |  |
| 2.229999999999921 | 0.007 |  |  |
| 2.232499999999921 | 0.007 |  |  |
| 2.234999999999921 | 0.007 |  |  |
| 2.237499999999921 | 0.007 |  |  |
| 2.239999999999921 | 0.007 |  |  |
| 2.242499999999921 | 0.007 |  |  |
| 2.244999999999921 | 0.006 |  |  |
| 2.247499999999921 | 0.006 |  |  |
| 2.249999999999921 | 0.006 |  |  |
| 2.252499999999921 | 0.006 |  |  |
| 2.254999999999921 | 0.006 |  |  |
| 2.257499999999921 | 0.006 |  |  |
| 2.259999999999921 | 0.006 |  |  |
| 2.262499999999921 | 0.006 |  |  |
| 2.264999999999921 | 0.006 |  |  |
| 2.267499999999921 | 0.006 |  |  |
| 2.26999999999992 | 0.006 |  |  |
| 2.27249999999992 | 0.006 |  |  |
| 2.27499999999992 | 0.006 |  |  |
| 2.27749999999992 | 0.006 |  |  |
| 2.27999999999992 | 0.006 |  |  |
| 2.28249999999992 | 0.005 |  |  |
| 2.28499999999992 | 0.005 |  |  |
| 2.28749999999992 | 0.005 |  |  |
| 2.28999999999992 | 0.005 |  |  |
| 2.29249999999992 | 0.005 |  |  |
| 2.29499999999992 | 0.005 |  |  |
| 2.29749999999992 | 0.005 |  |  |
| 2.29999999999992 | 0.005 |  |  |
| 2.30249999999992 | 0.005 |  |  |
| 2.30499999999992 | 0.005 |  |  |
| 2.30749999999992 | 0.005 |  |  |
| 2.30999999999992 | 0.005 |  |  |
| 2.31249999999992 | 0.005 |  |  |
| 2.31499999999992 | 0.005 |  |  |
| 2.317499999999919 | 0.005 |  |  |
| 2.319999999999919 | 0.005 |  |  |
| 2.322499999999919 | 0.005 |  |  |
| 2.324999999999919 | 0.004 |  |  |
| 2.327499999999919 | 0.004 |  |  |
| 2.329999999999919 | 0.004 |  |  |
| 2.332499999999919 | 0.004 |  |  |
| 2.334999999999919 | 0.004 |  |  |
| 2.337499999999919 | 0.004 |  |  |
| 2.339999999999919 | 0.004 |  |  |
| 2.342499999999919 | 0.004 |  |  |
| 2.344999999999919 | 0.004 |  |  |
| 2.347499999999919 | 0.004 |  |  |
| 2.349999999999919 | 0.004 |  |  |
| 2.352499999999919 | 0.004 |  |  |
| 2.354999999999919 | 0.004 |  |  |
| 2.357499999999919 | 0.004 |  |  |
| 2.359999999999919 | 0.004 |  |  |
| 2.362499999999918 | 0.004 |  |  |
| 2.364999999999918 | 0.004 |  |  |
| 2.367499999999918 | 0.004 |  |  |
| 2.369999999999918 | 0.004 |  |  |
| 2.372499999999918 | 0.004 |  |  |
| 2.374999999999918 | 0.004 |  |  |
| 2.377499999999918 | 0.004 |  |  |
| 2.379999999999918 | 0.003 |  |  |
| 2.382499999999918 | 0.003 |  |  |
| 2.384999999999918 | 0.003 |  |  |
| 2.387499999999918 | 0.003 |  |  |
| 2.389999999999918 | 0.003 |  |  |
| 2.392499999999918 | 0.003 |  |  |
| 2.394999999999918 | 0.003 |  |  |
| 2.397499999999918 | 0.003 |  |  |
| 2.399999999999918 | 0.003 |  |  |
| 2.402499999999918 | 0.003 |  |  |
| 2.404999999999918 | 0.003 |  |  |
| 2.407499999999918 | 0.003 |  |  |
| 2.409999999999918 | 0.003 |  |  |
| 2.412499999999917 | 0.003 |  |  |
| 2.414999999999917 | 0.003 |  |  |
| 2.417499999999917 | 0.003 |  |  |
| 2.419999999999917 | 0.003 |  |  |
| 2.422499999999917 | 0.003 |  |  |
| 2.424999999999917 | 0.003 |  |  |
| 2.427499999999917 | 0.003 |  |  |
| 2.429999999999917 | 0.003 |  |  |
| 2.432499999999917 | 0.003 |  |  |
| 2.434999999999917 | 0.003 |  |  |
| 2.437499999999917 | 0.003 |  |  |
| 2.439999999999917 | 0.003 |  |  |
| 2.442499999999917 | 0.003 |  |  |
| 2.444999999999917 | 0.003 |  |  |
| 2.447499999999917 | 0.003 |  |  |
| 2.449999999999917 | 0.002 |  |  |
| 2.452499999999917 | 0.002 |  |  |
| 2.454999999999917 | 0.002 |  |  |
| 2.457499999999916 | 0.002 |  |  |
| 2.459999999999916 | 0.002 |  |  |
| 2.462499999999916 | 0.002 |  |  |
| 2.464999999999916 | 0.002 |  |  |
| 2.467499999999916 | 0.002 |  |  |
| 2.469999999999916 | 0.002 |  |  |
| 2.472499999999916 | 0.002 |  |  |
| 2.474999999999916 | 0.002 |  |  |
| 2.477499999999916 | 0.002 |  |  |
| 2.479999999999916 | 0.002 |  |  |
| 2.482499999999916 | 0.002 |  |  |
| 2.484999999999916 | 0.002 |  |  |
| 2.487499999999916 | 0.002 |  |  |
| 2.489999999999916 | 0.002 |  |  |
| 2.492499999999916 | 0.002 |  |  |
| 2.494999999999916 | 0.002 |  |  |
| 2.497499999999916 | 0.002 |  |  |
| 2.499999999999916 | 0.002 |  |  |